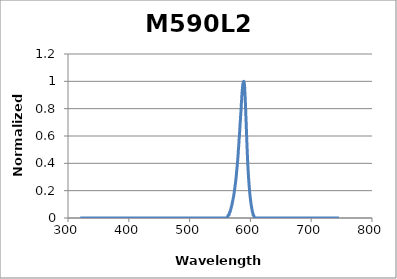
| Category | Normalized Intensity |
|---|---|
| 320.14817633 | 0 |
| 320.25686297 | 0 |
| 320.36555585 | 0 |
| 320.47425497 | 0 |
| 320.58296033 | 0 |
| 320.69167192 | 0 |
| 320.80038974 | 0 |
| 320.9091138 | 0 |
| 321.01784408 | 0 |
| 321.12658059 | 0 |
| 321.23532333 | 0 |
| 321.3440723 | 0 |
| 321.45282748 | 0 |
| 321.56158889 | 0 |
| 321.67035652 | 0 |
| 321.77913037 | 0 |
| 321.88791044 | 0 |
| 321.99669672 | 0 |
| 322.10548922 | 0 |
| 322.21428793 | 0 |
| 322.32309285 | 0 |
| 322.43190398 | 0 |
| 322.54072132 | 0 |
| 322.64954486 | 0 |
| 322.75837461 | 0 |
| 322.86721057 | 0 |
| 322.97605272 | 0 |
| 323.08490108 | 0 |
| 323.19375563 | 0 |
| 323.30261639 | 0 |
| 323.41148333 | 0 |
| 323.52035648 | 0 |
| 323.62923581 | 0 |
| 323.73812134 | 0 |
| 323.84701305 | 0 |
| 323.95591096 | 0 |
| 324.06481505 | 0 |
| 324.17372533 | 0 |
| 324.28264178 | 0 |
| 324.39156443 | 0 |
| 324.50049325 | 0 |
| 324.60942825 | 0 |
| 324.71836943 | 0 |
| 324.82731678 | 0 |
| 324.93627031 | 0 |
| 325.04523001 | 0 |
| 325.15419588 | 0 |
| 325.26316792 | 0 |
| 325.37214613 | 0 |
| 325.48113051 | 0 |
| 325.59012105 | 0 |
| 325.69911775 | 0 |
| 325.80812062 | 0 |
| 325.91712964 | 0 |
| 326.02614483 | 0 |
| 326.13516617 | 0 |
| 326.24419367 | 0 |
| 326.35322732 | 0 |
| 326.46226713 | 0 |
| 326.57131308 | 0 |
| 326.68036519 | 0 |
| 326.78942344 | 0 |
| 326.89848784 | 0 |
| 327.00755839 | 0 |
| 327.11663508 | 0 |
| 327.22571791 | 0 |
| 327.33480688 | 0 |
| 327.44390199 | 0 |
| 327.55300323 | 0 |
| 327.66211061 | 0 |
| 327.77122413 | 0 |
| 327.88034378 | 0 |
| 327.98946956 | 0 |
| 328.09860147 | 0 |
| 328.20773951 | 0 |
| 328.31688367 | 0 |
| 328.42603396 | 0 |
| 328.53519037 | 0 |
| 328.6443529 | 0 |
| 328.75352156 | 0 |
| 328.86269633 | 0 |
| 328.97187722 | 0 |
| 329.08106423 | 0 |
| 329.19025735 | 0 |
| 329.29945658 | 0 |
| 329.40866192 | 0 |
| 329.51787337 | 0 |
| 329.62709093 | 0 |
| 329.7363146 | 0 |
| 329.84554437 | 0 |
| 329.95478025 | 0 |
| 330.06402222 | 0 |
| 330.1732703 | 0 |
| 330.28252448 | 0 |
| 330.39178475 | 0 |
| 330.50105112 | 0 |
| 330.61032358 | 0 |
| 330.71960213 | 0 |
| 330.82888678 | 0 |
| 330.93817751 | 0 |
| 331.04747434 | 0 |
| 331.15677725 | 0 |
| 331.26608624 | 0 |
| 331.37540132 | 0 |
| 331.48472248 | 0 |
| 331.59404972 | 0 |
| 331.70338303 | 0 |
| 331.81272243 | 0 |
| 331.9220679 | 0 |
| 332.03141944 | 0 |
| 332.14077706 | 0 |
| 332.25014075 | 0 |
| 332.3595105 | 0 |
| 332.46888633 | 0 |
| 332.57826822 | 0 |
| 332.68765617 | 0 |
| 332.79705019 | 0 |
| 332.90645027 | 0 |
| 333.01585641 | 0 |
| 333.12526861 | 0 |
| 333.23468687 | 0 |
| 333.34411118 | 0 |
| 333.45354155 | 0 |
| 333.56297796 | 0 |
| 333.67242043 | 0 |
| 333.78186895 | 0 |
| 333.89132352 | 0 |
| 334.00078413 | 0 |
| 334.11025079 | 0 |
| 334.21972349 | 0 |
| 334.32920223 | 0 |
| 334.43868701 | 0 |
| 334.54817783 | 0 |
| 334.65767469 | 0 |
| 334.76717758 | 0 |
| 334.8766865 | 0 |
| 334.98620146 | 0 |
| 335.09572245 | 0 |
| 335.20524947 | 0 |
| 335.31478252 | 0 |
| 335.42432159 | 0 |
| 335.53386669 | 0 |
| 335.64341781 | 0 |
| 335.75297495 | 0 |
| 335.86253811 | 0 |
| 335.97210729 | 0 |
| 336.08168249 | 0 |
| 336.1912637 | 0 |
| 336.30085093 | 0 |
| 336.41044416 | 0 |
| 336.52004341 | 0 |
| 336.62964867 | 0 |
| 336.73925994 | 0 |
| 336.84887721 | 0 |
| 336.95850049 | 0 |
| 337.06812977 | 0 |
| 337.17776505 | 0 |
| 337.28740633 | 0 |
| 337.39705361 | 0 |
| 337.50670688 | 0 |
| 337.61636616 | 0 |
| 337.72603142 | 0 |
| 337.83570268 | 0 |
| 337.94537993 | 0 |
| 338.05506317 | 0 |
| 338.16475239 | 0 |
| 338.2744476 | 0 |
| 338.3841488 | 0 |
| 338.49385598 | 0 |
| 338.60356914 | 0 |
| 338.71328828 | 0 |
| 338.8230134 | 0 |
| 338.93274449 | 0 |
| 339.04248156 | 0 |
| 339.15222461 | 0 |
| 339.26197362 | 0 |
| 339.37172861 | 0 |
| 339.48148957 | 0 |
| 339.59125649 | 0 |
| 339.70102938 | 0 |
| 339.81080823 | 0 |
| 339.92059305 | 0 |
| 340.03038383 | 0 |
| 340.14018057 | 0 |
| 340.24998327 | 0 |
| 340.35979192 | 0 |
| 340.46960653 | 0 |
| 340.57942709 | 0 |
| 340.6892536 | 0 |
| 340.79908607 | 0 |
| 340.90892448 | 0 |
| 341.01876885 | 0 |
| 341.12861915 | 0 |
| 341.2384754 | 0 |
| 341.3483376 | 0 |
| 341.45820574 | 0 |
| 341.56807981 | 0 |
| 341.67795983 | 0 |
| 341.78784578 | 0 |
| 341.89773766 | 0 |
| 342.00763548 | 0 |
| 342.11753924 | 0 |
| 342.22744892 | 0 |
| 342.33736453 | 0 |
| 342.44728607 | 0 |
| 342.55721353 | 0 |
| 342.66714692 | 0 |
| 342.77708623 | 0 |
| 342.88703147 | 0 |
| 342.99698262 | 0 |
| 343.10693969 | 0 |
| 343.21690268 | 0 |
| 343.32687158 | 0 |
| 343.4368464 | 0 |
| 343.54682713 | 0 |
| 343.65681377 | 0 |
| 343.76680631 | 0 |
| 343.87680477 | 0 |
| 343.98680913 | 0 |
| 344.0968194 | 0 |
| 344.20683557 | 0 |
| 344.31685763 | 0 |
| 344.4268856 | 0 |
| 344.53691947 | 0 |
| 344.64695924 | 0 |
| 344.75700489 | 0 |
| 344.86705645 | 0 |
| 344.97711389 | 0 |
| 345.08717723 | 0 |
| 345.19724645 | 0 |
| 345.30732156 | 0 |
| 345.41740256 | 0 |
| 345.52748944 | 0 |
| 345.63758221 | 0 |
| 345.74768085 | 0 |
| 345.85778538 | 0 |
| 345.96789578 | 0 |
| 346.07801206 | 0 |
| 346.18813421 | 0 |
| 346.29826224 | 0 |
| 346.40839614 | 0 |
| 346.51853591 | 0 |
| 346.62868155 | 0 |
| 346.73883306 | 0 |
| 346.84899043 | 0 |
| 346.95915367 | 0 |
| 347.06932277 | 0 |
| 347.17949773 | 0 |
| 347.28967855 | 0 |
| 347.39986522 | 0 |
| 347.51005776 | 0 |
| 347.62025615 | 0 |
| 347.73046039 | 0 |
| 347.84067049 | 0 |
| 347.95088643 | 0 |
| 348.06110823 | 0 |
| 348.17133587 | 0 |
| 348.28156935 | 0 |
| 348.39180868 | 0 |
| 348.50205386 | 0 |
| 348.61230487 | 0 |
| 348.72256173 | 0 |
| 348.83282442 | 0 |
| 348.94309295 | 0 |
| 349.05336731 | 0 |
| 349.16364751 | 0 |
| 349.27393354 | 0 |
| 349.3842254 | 0 |
| 349.49452309 | 0 |
| 349.6048266 | 0 |
| 349.71513594 | 0 |
| 349.82545111 | 0 |
| 349.93577209 | 0 |
| 350.0460989 | 0 |
| 350.15643153 | 0 |
| 350.26676998 | 0 |
| 350.37711424 | 0 |
| 350.48746432 | 0 |
| 350.59782021 | 0 |
| 350.70818191 | 0 |
| 350.81854942 | 0 |
| 350.92892274 | 0 |
| 351.03930187 | 0 |
| 351.14968681 | 0 |
| 351.26007754 | 0 |
| 351.37047409 | 0 |
| 351.48087643 | 0 |
| 351.59128457 | 0 |
| 351.70169851 | 0 |
| 351.81211824 | 0 |
| 351.92254377 | 0 |
| 352.0329751 | 0 |
| 352.14341221 | 0 |
| 352.25385512 | 0 |
| 352.36430381 | 0 |
| 352.47475829 | 0 |
| 352.58521856 | 0 |
| 352.69568461 | 0 |
| 352.80615644 | 0 |
| 352.91663406 | 0 |
| 353.02711745 | 0 |
| 353.13760662 | 0 |
| 353.24810157 | 0 |
| 353.35860229 | 0 |
| 353.46910879 | 0 |
| 353.57962106 | 0 |
| 353.69013909 | 0 |
| 353.8006629 | 0 |
| 353.91119247 | 0 |
| 354.02172781 | 0 |
| 354.13226891 | 0 |
| 354.24281578 | 0 |
| 354.3533684 | 0 |
| 354.46392679 | 0 |
| 354.57449093 | 0 |
| 354.68506083 | 0 |
| 354.79563649 | 0 |
| 354.90621789 | 0 |
| 355.01680505 | 0 |
| 355.12739796 | 0 |
| 355.23799662 | 0 |
| 355.34860102 | 0 |
| 355.45921117 | 0 |
| 355.56982707 | 0 |
| 355.6804487 | 0 |
| 355.79107608 | 0 |
| 355.9017092 | 0 |
| 356.01234805 | 0 |
| 356.12299264 | 0 |
| 356.23364297 | 0 |
| 356.34429902 | 0 |
| 356.45496081 | 0 |
| 356.56562833 | 0 |
| 356.67630158 | 0 |
| 356.78698056 | 0 |
| 356.89766526 | 0 |
| 357.00835568 | 0 |
| 357.11905183 | 0 |
| 357.2297537 | 0 |
| 357.34046128 | 0 |
| 357.45117459 | 0 |
| 357.56189361 | 0 |
| 357.67261835 | 0 |
| 357.78334879 | 0 |
| 357.89408495 | 0 |
| 358.00482682 | 0 |
| 358.1155744 | 0 |
| 358.22632769 | 0 |
| 358.33708668 | 0 |
| 358.44785137 | 0 |
| 358.55862177 | 0 |
| 358.66939787 | 0 |
| 358.78017966 | 0 |
| 358.89096716 | 0 |
| 359.00176035 | 0 |
| 359.11255923 | 0 |
| 359.22336381 | 0 |
| 359.33417408 | 0 |
| 359.44499004 | 0 |
| 359.55581169 | 0 |
| 359.66663902 | 0 |
| 359.77747204 | 0 |
| 359.88831075 | 0 |
| 359.99915513 | 0 |
| 360.1100052 | 0 |
| 360.22086094 | 0 |
| 360.33172237 | 0 |
| 360.44258947 | 0 |
| 360.55346224 | 0 |
| 360.66434069 | 0 |
| 360.77522481 | 0 |
| 360.8861146 | 0 |
| 360.99701005 | 0 |
| 361.10791118 | 0 |
| 361.21881796 | 0 |
| 361.32973042 | 0 |
| 361.44064853 | 0 |
| 361.55157231 | 0 |
| 361.66250174 | 0 |
| 361.77343683 | 0 |
| 361.88437758 | 0 |
| 361.99532398 | 0 |
| 362.10627604 | 0 |
| 362.21723374 | 0 |
| 362.3281971 | 0 |
| 362.43916611 | 0 |
| 362.55014076 | 0 |
| 362.66112105 | 0 |
| 362.77210699 | 0 |
| 362.88309858 | 0 |
| 362.9940958 | 0 |
| 363.10509866 | 0 |
| 363.21610716 | 0 |
| 363.3271213 | 0 |
| 363.43814107 | 0 |
| 363.54916647 | 0 |
| 363.6601975 | 0 |
| 363.77123417 | 0 |
| 363.88227646 | 0 |
| 363.99332438 | 0 |
| 364.10437792 | 0 |
| 364.21543709 | 0 |
| 364.32650188 | 0 |
| 364.43757229 | 0 |
| 364.54864832 | 0 |
| 364.65972997 | 0 |
| 364.77081723 | 0 |
| 364.88191011 | 0 |
| 364.9930086 | 0 |
| 365.1041127 | 0 |
| 365.21522241 | 0 |
| 365.32633773 | 0 |
| 365.43745866 | 0 |
| 365.54858519 | 0 |
| 365.65971732 | 0 |
| 365.77085506 | 0 |
| 365.88199839 | 0 |
| 365.99314733 | 0 |
| 366.10430186 | 0 |
| 366.21546199 | 0 |
| 366.32662772 | 0 |
| 366.43779903 | 0 |
| 366.54897594 | 0 |
| 366.66015844 | 0 |
| 366.77134652 | 0 |
| 366.88254019 | 0 |
| 366.99373945 | 0 |
| 367.10494429 | 0 |
| 367.21615471 | 0 |
| 367.32737072 | 0 |
| 367.4385923 | 0 |
| 367.54981946 | 0 |
| 367.66105219 | 0 |
| 367.7722905 | 0 |
| 367.88353438 | 0 |
| 367.99478384 | 0 |
| 368.10603886 | 0 |
| 368.21729945 | 0 |
| 368.32856561 | 0 |
| 368.43983733 | 0 |
| 368.55111462 | 0 |
| 368.66239746 | 0 |
| 368.77368587 | 0 |
| 368.88497984 | 0 |
| 368.99627936 | 0 |
| 369.10758444 | 0 |
| 369.21889508 | 0 |
| 369.33021127 | 0 |
| 369.441533 | 0 |
| 369.55286029 | 0 |
| 369.66419313 | 0 |
| 369.77553151 | 0 |
| 369.88687544 | 0 |
| 369.99822491 | 0 |
| 370.10957992 | 0 |
| 370.22094047 | 0 |
| 370.33230656 | 0 |
| 370.44367819 | 0 |
| 370.55505536 | 0 |
| 370.66643806 | 0 |
| 370.77782629 | 0 |
| 370.88922005 | 0 |
| 371.00061934 | 0 |
| 371.11202416 | 0 |
| 371.22343451 | 0 |
| 371.33485038 | 0 |
| 371.44627178 | 0 |
| 371.55769869 | 0 |
| 371.66913113 | 0 |
| 371.78056908 | 0 |
| 371.89201256 | 0 |
| 372.00346155 | 0 |
| 372.11491605 | 0 |
| 372.22637606 | 0 |
| 372.33784159 | 0 |
| 372.44931262 | 0 |
| 372.56078917 | 0 |
| 372.67227122 | 0 |
| 372.78375877 | 0 |
| 372.89525183 | 0 |
| 373.00675039 | 0 |
| 373.11825445 | 0 |
| 373.22976401 | 0 |
| 373.34127907 | 0 |
| 373.45279962 | 0 |
| 373.56432566 | 0 |
| 373.6758572 | 0 |
| 373.78739423 | 0 |
| 373.89893675 | 0 |
| 374.01048476 | 0 |
| 374.12203825 | 0 |
| 374.23359723 | 0 |
| 374.34516169 | 0 |
| 374.45673163 | 0 |
| 374.56830705 | 0 |
| 374.67988796 | 0 |
| 374.79147433 | 0 |
| 374.90306619 | 0 |
| 375.01466352 | 0 |
| 375.12626632 | 0 |
| 375.23787459 | 0 |
| 375.34948833 | 0 |
| 375.46110754 | 0 |
| 375.57273221 | 0 |
| 375.68436235 | 0 |
| 375.79599796 | 0 |
| 375.90763902 | 0 |
| 376.01928555 | 0 |
| 376.13093753 | 0 |
| 376.24259497 | 0 |
| 376.35425787 | 0 |
| 376.46592622 | 0 |
| 376.57760002 | 0 |
| 376.68927927 | 0 |
| 376.80096397 | 0 |
| 376.91265413 | 0 |
| 377.02434972 | 0 |
| 377.13605076 | 0 |
| 377.24775725 | 0 |
| 377.35946917 | 0 |
| 377.47118654 | 0 |
| 377.58290935 | 0 |
| 377.69463759 | 0 |
| 377.80637126 | 0 |
| 377.91811038 | 0 |
| 378.02985492 | 0 |
| 378.14160489 | 0 |
| 378.2533603 | 0 |
| 378.36512113 | 0 |
| 378.47688739 | 0 |
| 378.58865907 | 0 |
| 378.70043617 | 0 |
| 378.8122187 | 0 |
| 378.92400665 | 0 |
| 379.03580001 | 0 |
| 379.1475988 | 0 |
| 379.25940299 | 0 |
| 379.37121261 | 0 |
| 379.48302763 | 0 |
| 379.59484806 | 0 |
| 379.70667391 | 0 |
| 379.81850516 | 0 |
| 379.93034182 | 0 |
| 380.04218388 | 0 |
| 380.15403135 | 0 |
| 380.26588421 | 0 |
| 380.37774248 | 0 |
| 380.48960615 | 0 |
| 380.60147521 | 0 |
| 380.71334967 | 0 |
| 380.82522952 | 0 |
| 380.93711476 | 0 |
| 381.0490054 | 0 |
| 381.16090142 | 0 |
| 381.27280283 | 0 |
| 381.38470963 | 0 |
| 381.49662181 | 0 |
| 381.60853938 | 0 |
| 381.72046232 | 0 |
| 381.83239065 | 0 |
| 381.94432436 | 0 |
| 382.05626344 | 0 |
| 382.16820789 | 0 |
| 382.28015772 | 0 |
| 382.39211293 | 0 |
| 382.5040735 | 0 |
| 382.61603944 | 0 |
| 382.72801076 | 0 |
| 382.83998743 | 0 |
| 382.95196947 | 0 |
| 383.06395688 | 0 |
| 383.17594964 | 0 |
| 383.28794777 | 0 |
| 383.39995125 | 0 |
| 383.51196009 | 0 |
| 383.62397429 | 0 |
| 383.73599384 | 0 |
| 383.84801874 | 0 |
| 383.96004899 | 0 |
| 384.07208459 | 0 |
| 384.18412554 | 0 |
| 384.29617184 | 0 |
| 384.40822348 | 0 |
| 384.52028046 | 0 |
| 384.63234278 | 0 |
| 384.74441044 | 0 |
| 384.85648345 | 0 |
| 384.96856178 | 0 |
| 385.08064546 | 0 |
| 385.19273447 | 0 |
| 385.30482881 | 0 |
| 385.41692848 | 0 |
| 385.52903347 | 0 |
| 385.6411438 | 0 |
| 385.75325945 | 0 |
| 385.86538043 | 0 |
| 385.97750673 | 0 |
| 386.08963835 | 0 |
| 386.20177529 | 0 |
| 386.31391755 | 0 |
| 386.42606513 | 0 |
| 386.53821802 | 0 |
| 386.65037622 | 0 |
| 386.76253974 | 0 |
| 386.87470857 | 0 |
| 386.9868827 | 0 |
| 387.09906215 | 0 |
| 387.2112469 | 0 |
| 387.32343695 | 0 |
| 387.43563231 | 0 |
| 387.54783297 | 0 |
| 387.66003892 | 0 |
| 387.77225018 | 0 |
| 387.88446673 | 0 |
| 387.99668858 | 0 |
| 388.10891572 | 0 |
| 388.22114815 | 0 |
| 388.33338588 | 0 |
| 388.44562889 | 0 |
| 388.55787719 | 0 |
| 388.67013078 | 0 |
| 388.78238965 | 0 |
| 388.8946538 | 0 |
| 389.00692323 | 0 |
| 389.11919795 | 0 |
| 389.23147794 | 0 |
| 389.34376321 | 0 |
| 389.45605375 | 0 |
| 389.56834957 | 0 |
| 389.68065066 | 0 |
| 389.79295702 | 0 |
| 389.90526865 | 0 |
| 390.01758554 | 0 |
| 390.1299077 | 0 |
| 390.24223513 | 0 |
| 390.35456782 | 0 |
| 390.46690577 | 0 |
| 390.57924898 | 0 |
| 390.69159745 | 0 |
| 390.80395117 | 0 |
| 390.91631015 | 0 |
| 391.02867438 | 0 |
| 391.14104387 | 0 |
| 391.2534186 | 0 |
| 391.36579858 | 0 |
| 391.47818382 | 0 |
| 391.59057429 | 0 |
| 391.70297001 | 0 |
| 391.81537098 | 0 |
| 391.92777718 | 0 |
| 392.04018863 | 0 |
| 392.15260531 | 0 |
| 392.26502723 | 0 |
| 392.37745438 | 0 |
| 392.48988677 | 0 |
| 392.60232439 | 0 |
| 392.71476724 | 0 |
| 392.82721532 | 0 |
| 392.93966862 | 0 |
| 393.05212715 | 0 |
| 393.16459091 | 0 |
| 393.27705989 | 0 |
| 393.38953408 | 0 |
| 393.5020135 | 0 |
| 393.61449814 | 0 |
| 393.72698799 | 0 |
| 393.83948306 | 0 |
| 393.95198334 | 0 |
| 394.06448883 | 0 |
| 394.17699954 | 0 |
| 394.28951545 | 0 |
| 394.40203657 | 0 |
| 394.51456289 | 0 |
| 394.62709442 | 0 |
| 394.73963116 | 0 |
| 394.85217309 | 0 |
| 394.96472022 | 0 |
| 395.07727255 | 0 |
| 395.18983008 | 0 |
| 395.3023928 | 0 |
| 395.41496071 | 0 |
| 395.52753382 | 0 |
| 395.64011212 | 0 |
| 395.7526956 | 0 |
| 395.86528427 | 0 |
| 395.97787813 | 0 |
| 396.09047717 | 0 |
| 396.2030814 | 0 |
| 396.3156908 | 0 |
| 396.42830539 | 0 |
| 396.54092515 | 0 |
| 396.65355009 | 0 |
| 396.76618021 | 0 |
| 396.87881549 | 0 |
| 396.99145595 | 0 |
| 397.10410158 | 0 |
| 397.21675238 | 0 |
| 397.32940834 | 0 |
| 397.44206947 | 0 |
| 397.55473577 | 0 |
| 397.66740723 | 0 |
| 397.78008384 | 0 |
| 397.89276562 | 0 |
| 398.00545256 | 0 |
| 398.11814465 | 0 |
| 398.23084189 | 0 |
| 398.34354429 | 0 |
| 398.45625184 | 0 |
| 398.56896455 | 0 |
| 398.6816824 | 0 |
| 398.79440539 | 0 |
| 398.90713353 | 0 |
| 399.01986682 | 0 |
| 399.13260525 | 0 |
| 399.24534882 | 0 |
| 399.35809753 | 0 |
| 399.47085137 | 0 |
| 399.58361036 | 0 |
| 399.69637448 | 0 |
| 399.80914373 | 0 |
| 399.92191811 | 0 |
| 400.03469762 | 0 |
| 400.14748226 | 0 |
| 400.26027203 | 0 |
| 400.37306692 | 0 |
| 400.48586694 | 0 |
| 400.59867208 | 0 |
| 400.71148234 | 0 |
| 400.82429772 | 0 |
| 400.93711822 | 0 |
| 401.04994383 | 0 |
| 401.16277456 | 0 |
| 401.2756104 | 0 |
| 401.38845136 | 0 |
| 401.50129742 | 0 |
| 401.61414859 | 0 |
| 401.72700487 | 0 |
| 401.83986625 | 0 |
| 401.95273274 | 0 |
| 402.06560433 | 0 |
| 402.17848102 | 0 |
| 402.29136281 | 0 |
| 402.4042497 | 0 |
| 402.51714169 | 0 |
| 402.63003876 | 0 |
| 402.74294094 | 0 |
| 402.8558482 | 0 |
| 402.96876055 | 0 |
| 403.08167799 | 0 |
| 403.19460052 | 0 |
| 403.30752814 | 0 |
| 403.42046083 | 0 |
| 403.53339861 | 0 |
| 403.64634147 | 0 |
| 403.75928941 | 0 |
| 403.87224243000003 | 0 |
| 403.98520053 | 0 |
| 404.09816369 | 0 |
| 404.21113193 | 0 |
| 404.32410525 | 0 |
| 404.43708363 | 0 |
| 404.55006708 | 0 |
| 404.6630556 | 0 |
| 404.77604918 | 0 |
| 404.88904783 | 0 |
| 405.00205154 | 0 |
| 405.11506031 | 0 |
| 405.22807414 | 0 |
| 405.34109302 | 0 |
| 405.45411697 | 0 |
| 405.56714596 | 0 |
| 405.68018001 | 0 |
| 405.79321911 | 0 |
| 405.90626326 | 0 |
| 406.01931246 | 0 |
| 406.13236671 | 0 |
| 406.245426 | 0 |
| 406.35849034 | 0 |
| 406.47155972 | 0 |
| 406.58463413 | 0 |
| 406.69771359 | 0 |
| 406.81079809 | 0 |
| 406.92388762 | 0 |
| 407.03698218 | 0 |
| 407.15008178 | 0 |
| 407.26318641 | 0 |
| 407.37629607 | 0 |
| 407.48941076 | 0 |
| 407.60253047 | 0 |
| 407.71565521 | 0 |
| 407.82878497 | 0 |
| 407.94191976 | 0 |
| 408.05505956 | 0 |
| 408.16820439 | 0 |
| 408.28135423 | 0 |
| 408.39450909 | 0 |
| 408.50766896 | 0 |
| 408.62083385 | 0 |
| 408.73400375 | 0 |
| 408.84717865 | 0 |
| 408.96035857 | 0 |
| 409.07354349 | 0 |
| 409.18673342 | 0 |
| 409.29992835 | 0 |
| 409.41312828 | 0 |
| 409.52633321 | 0 |
| 409.63954314 | 0 |
| 409.75275807 | 0 |
| 409.865978 | 0 |
| 409.97920292 | 0 |
| 410.09243283 | 0 |
| 410.20566773 | 0 |
| 410.31890763 | 0 |
| 410.43215251 | 0 |
| 410.54540238 | 0 |
| 410.65865723 | 0 |
| 410.77191707 | 0 |
| 410.88518189 | 0 |
| 410.99845169 | 0 |
| 411.11172647 | 0 |
| 411.22500622 | 0 |
| 411.33829095 | 0 |
| 411.45158066 | 0 |
| 411.56487534 | 0 |
| 411.67817499 | 0 |
| 411.79147961 | 0 |
| 411.9047892 | 0 |
| 412.01810375 | 0 |
| 412.13142327 | 0 |
| 412.24474775 | 0 |
| 412.3580772 | 0 |
| 412.4714116 | 0 |
| 412.58475097 | 0 |
| 412.69809529 | 0 |
| 412.81144456 | 0 |
| 412.9247988 | 0 |
| 413.03815798 | 0 |
| 413.15152212 | 0 |
| 413.2648912 | 0 |
| 413.37826523 | 0 |
| 413.49164421 | 0 |
| 413.60502814 | 0 |
| 413.71841701 | 0 |
| 413.83181082 | 0 |
| 413.94520957 | 0 |
| 414.05861326 | 0 |
| 414.17202188 | 0 |
| 414.28543545 | 0 |
| 414.39885394 | 0 |
| 414.51227737 | 0 |
| 414.62570573 | 0 |
| 414.73913902 | 0 |
| 414.85257724 | 0 |
| 414.96602038 | 0 |
| 415.07946845 | 0 |
| 415.19292145 | 0 |
| 415.30637936 | 0 |
| 415.4198422 | 0 |
| 415.53330995 | 0 |
| 415.64678262 | 0 |
| 415.76026021 | 0 |
| 415.87374271 | 0 |
| 415.98723012 | 0 |
| 416.10072245 | 0 |
| 416.21421968 | 0 |
| 416.32772182 | 0 |
| 416.44122887 | 0 |
| 416.55474082 | 0 |
| 416.66825768 | 0 |
| 416.78177944 | 0 |
| 416.8953061 | 0 |
| 417.00883765 | 0 |
| 417.12237411 | 0 |
| 417.23591546 | 0 |
| 417.3494617 | 0 |
| 417.46301284 | 0 |
| 417.57656887 | 0 |
| 417.69012979 | 0 |
| 417.80369559 | 0 |
| 417.91726628 | 0 |
| 418.03084186 | 0 |
| 418.14442232 | 0 |
| 418.25800766 | 0 |
| 418.37159788 | 0 |
| 418.48519298 | 0 |
| 418.59879296 | 0 |
| 418.71239782 | 0 |
| 418.82600754 | 0 |
| 418.93962214 | 0 |
| 419.05324161 | 0 |
| 419.16686595 | 0 |
| 419.28049516 | 0 |
| 419.39412924 | 0 |
| 419.50776818 | 0 |
| 419.62141198 | 0 |
| 419.73506064 | 0 |
| 419.84871417 | 0 |
| 419.96237255 | 0 |
| 420.07603579 | 0 |
| 420.18970389 | 0 |
| 420.30337684 | 0 |
| 420.41705464 | 0 |
| 420.53073729 | 0 |
| 420.6444248 | 0 |
| 420.75811715 | 0 |
| 420.87181434 | 0 |
| 420.98551638 | 0 |
| 421.09922327 | 0 |
| 421.212935 | 0 |
| 421.32665156 | 0 |
| 421.44037297 | 0 |
| 421.55409921 | 0 |
| 421.66783029 | 0 |
| 421.7815662 | 0 |
| 421.89530694 | 0 |
| 422.00905252 | 0 |
| 422.12280292 | 0 |
| 422.23655815 | 0 |
| 422.35031821 | 0 |
| 422.46408309 | 0 |
| 422.5778528 | 0 |
| 422.69162733 | 0 |
| 422.80540667 | 0 |
| 422.91919084 | 0 |
| 423.03297982 | 0 |
| 423.14677362 | 0 |
| 423.26057223 | 0 |
| 423.37437566 | 0 |
| 423.4881839 | 0 |
| 423.60199694 | 0 |
| 423.71581479 | 0 |
| 423.82963745 | 0 |
| 423.94346492 | 0 |
| 424.05729718 | 0 |
| 424.17113425 | 0 |
| 424.28497612 | 0 |
| 424.39882279 | 0 |
| 424.51267425 | 0 |
| 424.62653051 | 0 |
| 424.74039156 | 0 |
| 424.85425741 | 0 |
| 424.96812804 | 0 |
| 425.08200347 | 0 |
| 425.19588368 | 0 |
| 425.30976868 | 0 |
| 425.42365846 | 0 |
| 425.53755303 | 0 |
| 425.65145238 | 0 |
| 425.76535651 | 0 |
| 425.87926541 | 0 |
| 425.9931791 | 0 |
| 426.10709756 | 0 |
| 426.22102079 | 0 |
| 426.33494879 | 0 |
| 426.44888157 | 0 |
| 426.56281911 | 0 |
| 426.67676143 | 0 |
| 426.7907085 | 0 |
| 426.90466035 | 0 |
| 427.01861695 | 0 |
| 427.13257832 | 0 |
| 427.24654445 | 0 |
| 427.36051534 | 0 |
| 427.47449098 | 0 |
| 427.58847138 | 0 |
| 427.70245653 | 0 |
| 427.81644643 | 0 |
| 427.93044109 | 0 |
| 428.04444049 | 0 |
| 428.15844464 | 0 |
| 428.27245354 | 0 |
| 428.38646718 | 0 |
| 428.50048557 | 0 |
| 428.61450869 | 0 |
| 428.72853656 | 0 |
| 428.84256916 | 0 |
| 428.9566065 | 0 |
| 429.07064858 | 0 |
| 429.18469539 | 0 |
| 429.29874693 | 0 |
| 429.41280321 | 0 |
| 429.52686421 | 0 |
| 429.64092994 | 0 |
| 429.75500039 | 0 |
| 429.86907557 | 0 |
| 429.98315548 | 0 |
| 430.0972401 | 0 |
| 430.21132944 | 0 |
| 430.32542351 | 0 |
| 430.43952229 | 0 |
| 430.55362578 | 0 |
| 430.66773399 | 0 |
| 430.78184691 | 0 |
| 430.89596454 | 0 |
| 431.01008688 | 0 |
| 431.12421393 | 0 |
| 431.23834568 | 0 |
| 431.35248214 | 0 |
| 431.4666233 | 0 |
| 431.58076916 | 0 |
| 431.69491972 | 0 |
| 431.80907498 | 0 |
| 431.92323494 | 0 |
| 432.03739959 | 0 |
| 432.15156893 | 0 |
| 432.26574297 | 0 |
| 432.3799217 | 0 |
| 432.49410511 | 0 |
| 432.60829322 | 0 |
| 432.72248601 | 0 |
| 432.83668348 | 0 |
| 432.95088564 | 0 |
| 433.06509248 | 0 |
| 433.179304 | 0 |
| 433.29352019 | 0 |
| 433.40774107 | 0 |
| 433.52196661 | 0 |
| 433.63619684 | 0 |
| 433.75043173 | 0 |
| 433.86467129 | 0 |
| 433.97891553 | 0 |
| 434.09316443 | 0 |
| 434.20741799 | 0 |
| 434.32167622 | 0 |
| 434.43593912 | 0 |
| 434.55020667 | 0 |
| 434.66447889 | 0 |
| 434.77875576 | 0 |
| 434.89303729 | 0 |
| 435.00732347 | 0 |
| 435.12161431 | 0 |
| 435.2359098 | 0 |
| 435.35020994 | 0 |
| 435.46451473 | 0 |
| 435.57882416 | 0 |
| 435.69313824 | 0 |
| 435.80745697 | 0 |
| 435.92178034 | 0 |
| 436.03610835 | 0 |
| 436.150441 | 0 |
| 436.26477829 | 0 |
| 436.37912021 | 0 |
| 436.49346677 | 0 |
| 436.60781796 | 0 |
| 436.72217379 | 0 |
| 436.83653424 | 0 |
| 436.95089932 | 0 |
| 437.06526904 | 0 |
| 437.17964337 | 0 |
| 437.29402233 | 0 |
| 437.40840592 | 0 |
| 437.52279412 | 0 |
| 437.63718695 | 0 |
| 437.75158439 | 0 |
| 437.86598645 | 0 |
| 437.98039312 | 0 |
| 438.09480441 | 0 |
| 438.20922031 | 0 |
| 438.32364082 | 0 |
| 438.43806593 | 0 |
| 438.55249566 | 0 |
| 438.66692999 | 0 |
| 438.78136893 | 0 |
| 438.89581246 | 0 |
| 439.0102606 | 0 |
| 439.12471334 | 0 |
| 439.23917068 | 0 |
| 439.35363261 | 0 |
| 439.46809914 | 0 |
| 439.58257026 | 0 |
| 439.69704597 | 0 |
| 439.81152627 | 0 |
| 439.92601117 | 0 |
| 440.04050065 | 0 |
| 440.15499471 | 0 |
| 440.26949336 | 0 |
| 440.38399659 | 0 |
| 440.4985044 | 0 |
| 440.61301679 | 0 |
| 440.72753376 | 0 |
| 440.84205531 | 0 |
| 440.95658143 | 0 |
| 441.07111213 | 0 |
| 441.18564739 | 0 |
| 441.30018723 | 0 |
| 441.41473163 | 0 |
| 441.5292806 | 0 |
| 441.64383414 | 0 |
| 441.75839224 | 0 |
| 441.87295491 | 0 |
| 441.98752213 | 0 |
| 442.10209392 | 0 |
| 442.21667026 | 0 |
| 442.33125116 | 0 |
| 442.44583661 | 0 |
| 442.56042662 | 0 |
| 442.67502118 | 0 |
| 442.78962029 | 0 |
| 442.90422394 | 0 |
| 443.01883215 | 0 |
| 443.1334449 | 0 |
| 443.24806219 | 0 |
| 443.36268403 | 0 |
| 443.47731041 | 0 |
| 443.59194132 | 0 |
| 443.70657678 | 0 |
| 443.82121677 | 0 |
| 443.93586129 | 0 |
| 444.05051035 | 0 |
| 444.16516394 | 0 |
| 444.27982206 | 0 |
| 444.39448471 | 0 |
| 444.50915189 | 0 |
| 444.62382359 | 0 |
| 444.73849982 | 0 |
| 444.85318056 | 0 |
| 444.96786583 | 0 |
| 445.08255562 | 0 |
| 445.19724993 | 0 |
| 445.31194875 | 0 |
| 445.42665209 | 0 |
| 445.54135994 | 0 |
| 445.6560723 | 0 |
| 445.77078917 | 0 |
| 445.88551055 | 0 |
| 446.00023644 | 0 |
| 446.11496683 | 0 |
| 446.22970173 | 0 |
| 446.34444113 | 0 |
| 446.45918503 | 0 |
| 446.57393342 | 0 |
| 446.68868632 | 0 |
| 446.80344371 | 0 |
| 446.9182056 | 0 |
| 447.03297198 | 0 |
| 447.14774285 | 0 |
| 447.26251822 | 0 |
| 447.37729807 | 0 |
| 447.49208241 | 0 |
| 447.60687123 | 0 |
| 447.72166453 | 0 |
| 447.83646232 | 0 |
| 447.95126459 | 0 |
| 448.06607134 | 0 |
| 448.18088257 | 0 |
| 448.29569827 | 0 |
| 448.41051845 | 0 |
| 448.5253431 | 0 |
| 448.64017222 | 0 |
| 448.75500582 | 0 |
| 448.86984388 | 0 |
| 448.9846864 | 0 |
| 449.0995334 | 0 |
| 449.21438485 | 0 |
| 449.32924077 | 0 |
| 449.44410115 | 0 |
| 449.55896599 | 0 |
| 449.67383529 | 0 |
| 449.78870904 | 0 |
| 449.90358725 | 0 |
| 450.01846991 | 0 |
| 450.13335702 | 0 |
| 450.24824858 | 0 |
| 450.36314459 | 0 |
| 450.47804504 | 0 |
| 450.59294995 | 0 |
| 450.70785929 | 0 |
| 450.82277308 | 0 |
| 450.93769131 | 0 |
| 451.05261398 | 0 |
| 451.16754108 | 0 |
| 451.28247262 | 0 |
| 451.3974086 | 0 |
| 451.51234901 | 0 |
| 451.62729385 | 0 |
| 451.74224312 | 0 |
| 451.85719681 | 0 |
| 451.97215494 | 0 |
| 452.08711749 | 0 |
| 452.20208446 | 0 |
| 452.31705586 | 0 |
| 452.43203168 | 0 |
| 452.54701191 | 0 |
| 452.66199657 | 0 |
| 452.77698563 | 0 |
| 452.89197912 | 0 |
| 453.00697702 | 0 |
| 453.12197932 | 0 |
| 453.23698604 | 0 |
| 453.35199717 | 0 |
| 453.4670127 | 0 |
| 453.58203264 | 0 |
| 453.69705698 | 0 |
| 453.81208572 | 0 |
| 453.92711887 | 0 |
| 454.04215641 | 0 |
| 454.15719835 | 0 |
| 454.27224469 | 0 |
| 454.38729542 | 0 |
| 454.50235054 | 0 |
| 454.61741006 | 0 |
| 454.73247396 | 0 |
| 454.84754226 | 0 |
| 454.96261494 | 0 |
| 455.077692 | 0 |
| 455.19277345 | 0 |
| 455.30785928 | 0 |
| 455.42294949 | 0 |
| 455.53804408 | 0 |
| 455.65314305 | 0 |
| 455.76824639 | 0 |
| 455.88335411 | 0 |
| 455.9984662 | 0 |
| 456.11358267 | 0 |
| 456.2287035 | 0 |
| 456.3438287 | 0 |
| 456.45895826 | 0 |
| 456.5740922 | 0 |
| 456.68923049 | 0 |
| 456.80437315 | 0 |
| 456.91952017 | 0 |
| 457.03467154 | 0 |
| 457.14982728 | 0 |
| 457.26498737 | 0 |
| 457.38015181 | 0 |
| 457.49532061 | 0 |
| 457.61049375 | 0 |
| 457.72567125 | 0 |
| 457.8408531 | 0 |
| 457.95603929 | 0 |
| 458.07122983 | 0 |
| 458.18642471 | 0 |
| 458.30162393 | 0 |
| 458.41682749 | 0 |
| 458.5320354 | 0 |
| 458.64724764 | 0 |
| 458.76246421 | 0 |
| 458.87768512 | 0 |
| 458.99291036 | 0 |
| 459.10813994 | 0 |
| 459.22337384 | 0 |
| 459.33861207 | 0 |
| 459.45385463 | 0 |
| 459.56910151 | 0 |
| 459.68435272 | 0 |
| 459.79960824 | 0 |
| 459.91486809 | 0 |
| 460.03013226 | 0 |
| 460.14540074 | 0 |
| 460.26067354 | 0 |
| 460.37595066 | 0 |
| 460.49123209 | 0 |
| 460.60651782 | 0 |
| 460.72180787 | 0 |
| 460.83710223 | 0 |
| 460.95240089 | 0 |
| 461.06770386 | 0 |
| 461.18301113 | 0 |
| 461.2983227 | 0 |
| 461.41363857 | 0 |
| 461.52895874 | 0 |
| 461.64428321 | 0 |
| 461.75961198 | 0 |
| 461.87494503 | 0 |
| 461.99028239 | 0 |
| 462.10562403 | 0 |
| 462.22096996 | 0 |
| 462.33632018 | 0 |
| 462.45167468 | 0 |
| 462.56703348 | 0 |
| 462.68239655 | 0 |
| 462.79776391 | 0 |
| 462.91313554 | 0 |
| 463.02851146 | 0 |
| 463.14389165 | 0 |
| 463.25927612 | 0 |
| 463.37466486 | 0 |
| 463.49005787 | 0 |
| 463.60545516 | 0 |
| 463.72085671 | 0 |
| 463.83626254 | 0 |
| 463.95167263 | 0 |
| 464.06708698 | 0 |
| 464.1825056 | 0 |
| 464.29792848 | 0 |
| 464.41335562 | 0 |
| 464.52878702 | 0 |
| 464.64422267 | 0 |
| 464.75966258 | 0 |
| 464.87510675 | 0 |
| 464.99055516 | 0 |
| 465.10600783 | 0 |
| 465.22146475 | 0 |
| 465.33692591 | 0 |
| 465.45239133 | 0 |
| 465.56786098 | 0 |
| 465.68333488 | 0 |
| 465.79881303 | 0 |
| 465.91429541 | 0 |
| 466.02978203 | 0 |
| 466.14527288 | 0 |
| 466.26076798 | 0 |
| 466.3762673 | 0 |
| 466.49177086 | 0 |
| 466.60727865 | 0 |
| 466.72279067 | 0 |
| 466.83830692 | 0 |
| 466.9538274 | 0 |
| 467.06935209 | 0 |
| 467.18488102 | 0 |
| 467.30041416 | 0 |
| 467.41595152 | 0 |
| 467.53149311 | 0 |
| 467.6470389 | 0 |
| 467.76258892 | 0 |
| 467.87814315 | 0 |
| 467.99370159 | 0 |
| 468.10926424 | 0 |
| 468.2248311 | 0 |
| 468.34040217 | 0 |
| 468.45597745 | 0 |
| 468.57155693 | 0 |
| 468.68714061 | 0 |
| 468.80272849 | 0 |
| 468.91832058 | 0 |
| 469.03391686 | 0 |
| 469.14951734 | 0 |
| 469.26512202 | 0 |
| 469.38073089 | 0 |
| 469.49634395 | 0 |
| 469.6119612 | 0 |
| 469.72758264 | 0 |
| 469.84320827 | 0 |
| 469.95883809 | 0 |
| 470.07447209 | 0 |
| 470.19011027 | 0 |
| 470.30575264 | 0 |
| 470.42139918 | 0 |
| 470.53704991 | 0 |
| 470.65270481 | 0 |
| 470.76836388 | 0 |
| 470.88402713 | 0 |
| 470.99969455 | 0 |
| 471.11536615 | 0 |
| 471.23104191 | 0 |
| 471.34672184 | 0 |
| 471.46240593 | 0 |
| 471.5780942 | 0 |
| 471.69378662 | 0 |
| 471.8094832 | 0 |
| 471.92518395 | 0 |
| 472.04088885 | 0 |
| 472.15659791 | 0 |
| 472.27231113 | 0 |
| 472.3880285 | 0 |
| 472.50375002 | 0 |
| 472.61947569 | 0 |
| 472.73520551 | 0 |
| 472.85093948 | 0 |
| 472.9666776 | 0 |
| 473.08241986 | 0 |
| 473.19816626 | 0 |
| 473.3139168 | 0 |
| 473.42967149 | 0 |
| 473.54543031 | 0 |
| 473.66119327 | 0 |
| 473.77696036 | 0 |
| 473.89273159 | 0 |
| 474.00850695 | 0 |
| 474.12428644 | 0 |
| 474.24007006 | 0 |
| 474.35585781 | 0 |
| 474.47164969 | 0 |
| 474.58744568 | 0 |
| 474.70324581 | 0 |
| 474.81905005 | 0 |
| 474.93485841 | 0 |
| 475.05067089 | 0 |
| 475.16648749 | 0 |
| 475.2823082 | 0 |
| 475.39813303 | 0 |
| 475.51396197 | 0 |
| 475.62979502 | 0 |
| 475.74563218 | 0 |
| 475.86147344 | 0 |
| 475.97731881 | 0 |
| 476.09316829 | 0 |
| 476.20902187 | 0 |
| 476.32487955 | 0 |
| 476.44074133 | 0 |
| 476.55660721 | 0 |
| 476.67247718 | 0 |
| 476.78835125 | 0 |
| 476.90422942 | 0 |
| 477.02011167 | 0 |
| 477.13599802 | 0 |
| 477.25188846 | 0 |
| 477.36778298 | 0 |
| 477.48368159 | 0 |
| 477.59958428 | 0 |
| 477.71549106 | 0 |
| 477.83140192 | 0 |
| 477.94731686 | 0 |
| 478.06323587 | 0 |
| 478.17915896 | 0 |
| 478.29508613 | 0 |
| 478.41101737 | 0 |
| 478.52695269 | 0 |
| 478.64289207 | 0 |
| 478.75883552 | 0 |
| 478.87478304 | 0 |
| 478.99073463 | 0 |
| 479.10669028 | 0 |
| 479.22264999 | 0 |
| 479.33861377 | 0 |
| 479.4545816 | 0 |
| 479.57055349 | 0 |
| 479.68652944 | 0 |
| 479.80250945 | 0 |
| 479.9184935 | 0 |
| 480.03448161 | 0 |
| 480.15047377 | 0 |
| 480.26646998 | 0 |
| 480.38247024 | 0 |
| 480.49847454 | 0 |
| 480.61448289 | 0 |
| 480.73049528 | 0 |
| 480.84651171 | 0 |
| 480.96253218 | 0 |
| 481.07855669 | 0 |
| 481.19458523 | 0 |
| 481.31061781 | 0 |
| 481.42665442 | 0 |
| 481.54269507 | 0 |
| 481.65873974 | 0 |
| 481.77478845 | 0 |
| 481.89084118 | 0 |
| 482.00689794 | 0 |
| 482.12295872 | 0 |
| 482.23902352 | 0 |
| 482.35509235 | 0 |
| 482.4711652 | 0 |
| 482.58724206 | 0 |
| 482.70332294 | 0 |
| 482.81940783 | 0 |
| 482.93549674 | 0 |
| 483.05158966 | 0 |
| 483.16768659 | 0 |
| 483.28378753 | 0 |
| 483.39989248 | 0 |
| 483.51600143 | 0 |
| 483.63211439 | 0 |
| 483.74823135 | 0 |
| 483.86435231 | 0 |
| 483.98047727 | 0 |
| 484.09660622 | 0 |
| 484.21273918 | 0 |
| 484.32887613 | 0 |
| 484.44501707 | 0 |
| 484.56116201 | 0 |
| 484.67731093 | 0 |
| 484.79346384 | 0 |
| 484.90962075 | 0 |
| 485.02578163 | 0 |
| 485.1419465 | 0 |
| 485.25811536 | 0 |
| 485.37428819 | 0 |
| 485.490465 | 0 |
| 485.6066458 | 0 |
| 485.72283056 | 0 |
| 485.83901931 | 0 |
| 485.95521202 | 0 |
| 486.07140871 | 0 |
| 486.18760937 | 0 |
| 486.303814 | 0 |
| 486.42002259 | 0 |
| 486.53623515 | 0 |
| 486.65245168 | 0 |
| 486.76867216 | 0 |
| 486.88489661 | 0 |
| 487.00112502 | 0 |
| 487.11735738 | 0 |
| 487.2335937 | 0 |
| 487.34983398 | 0 |
| 487.46607821 | 0 |
| 487.58232639 | 0 |
| 487.69857852 | 0 |
| 487.8148346 | 0 |
| 487.93109463 | 0 |
| 488.0473586 | 0 |
| 488.16362652 | 0 |
| 488.27989838 | 0 |
| 488.39617418 | 0 |
| 488.51245392 | 0 |
| 488.6287376 | 0 |
| 488.74502521 | 0 |
| 488.86131676 | 0 |
| 488.97761224 | 0 |
| 489.09391165 | 0 |
| 489.210215 | 0 |
| 489.32652227 | 0 |
| 489.44283347 | 0 |
| 489.55914859 | 0 |
| 489.67546764 | 0 |
| 489.79179062 | 0 |
| 489.90811751 | 0 |
| 490.02444832 | 0 |
| 490.14078305 | 0 |
| 490.25712169 | 0 |
| 490.37346426 | 0 |
| 490.48981073 | 0 |
| 490.60616111 | 0 |
| 490.72251541 | 0 |
| 490.83887361 | 0 |
| 490.95523573 | 0 |
| 491.07160174 | 0 |
| 491.18797166 | 0 |
| 491.30434549 | 0 |
| 491.42072321 | 0 |
| 491.53710483 | 0 |
| 491.65349035 | 0 |
| 491.76987977 | 0 |
| 491.88627308 | 0 |
| 492.00267029 | 0 |
| 492.11907138 | 0 |
| 492.23547637 | 0 |
| 492.35188524 | 0 |
| 492.46829801 | 0 |
| 492.58471465 | 0 |
| 492.70113519 | 0 |
| 492.8175596 | 0 |
| 492.93398789 | 0 |
| 493.05042007 | 0 |
| 493.16685612 | 0 |
| 493.28329605 | 0 |
| 493.39973985 | 0 |
| 493.51618752 | 0 |
| 493.63263907 | 0 |
| 493.74909449 | 0 |
| 493.86555377 | 0 |
| 493.98201693 | 0 |
| 494.09848394 | 0 |
| 494.21495482 | 0 |
| 494.33142957 | 0 |
| 494.44790817 | 0 |
| 494.56439064 | 0 |
| 494.68087696 | 0 |
| 494.79736714 | 0 |
| 494.91386117 | 0 |
| 495.03035905 | 0 |
| 495.14686079 | 0 |
| 495.26336638 | 0 |
| 495.37987581 | 0 |
| 495.49638909 | 0 |
| 495.61290622 | 0 |
| 495.72942719 | 0 |
| 495.845952 | 0 |
| 495.96248066 | 0 |
| 496.07901315 | 0 |
| 496.19554948 | 0 |
| 496.31208965 | 0 |
| 496.42863365 | 0 |
| 496.54518149 | 0 |
| 496.66173315 | 0 |
| 496.77828865 | 0 |
| 496.89484797 | 0 |
| 497.01141112 | 0 |
| 497.1279781 | 0 |
| 497.2445489 | 0 |
| 497.36112352 | 0 |
| 497.47770196 | 0 |
| 497.59428422 | 0 |
| 497.7108703 | 0 |
| 497.8274602 | 0 |
| 497.94405391 | 0 |
| 498.06065143 | 0 |
| 498.17725277 | 0 |
| 498.29385791 | 0 |
| 498.41046686 | 0 |
| 498.52707962 | 0 |
| 498.64369619 | 0 |
| 498.76031656 | 0 |
| 498.87694073 | 0 |
| 498.9935687 | 0 |
| 499.11020047 | 0 |
| 499.22683603 | 0 |
| 499.3434754 | 0 |
| 499.46011856 | 0 |
| 499.57676551 | 0 |
| 499.69341625 | 0 |
| 499.81007078 | 0 |
| 499.9267291 | 0 |
| 500.04339121 | 0 |
| 500.1600571 | 0 |
| 500.27672677 | 0 |
| 500.39340023 | 0 |
| 500.51007747 | 0 |
| 500.62675849 | 0 |
| 500.74344328 | 0 |
| 500.86013185 | 0 |
| 500.9768242 | 0 |
| 501.09352032 | 0 |
| 501.21022021 | 0 |
| 501.32692387 | 0 |
| 501.44363129 | 0 |
| 501.56034249 | 0 |
| 501.67705745 | 0 |
| 501.79377617 | 0 |
| 501.91049865 | 0 |
| 502.0272249 | 0 |
| 502.1439549 | 0 |
| 502.26068866 | 0 |
| 502.37742618 | 0 |
| 502.49416745 | 0 |
| 502.61091248 | 0 |
| 502.72766125 | 0 |
| 502.84441378 | 0 |
| 502.96117005 | 0 |
| 503.07793007 | 0 |
| 503.19469384 | 0 |
| 503.31146135 | 0 |
| 503.4282326 | 0 |
| 503.54500759 | 0 |
| 503.66178632 | 0 |
| 503.77856879 | 0 |
| 503.89535499 | 0 |
| 504.01214493 | 0 |
| 504.1289386 | 0 |
| 504.245736 | 0 |
| 504.36253713 | 0 |
| 504.47934199 | 0 |
| 504.59615058 | 0 |
| 504.71296289 | 0 |
| 504.82977892 | 0 |
| 504.94659868 | 0 |
| 505.06342216 | 0 |
| 505.18024935 | 0 |
| 505.29708027 | 0 |
| 505.41391489 | 0 |
| 505.53075324 | 0 |
| 505.64759529 | 0 |
| 505.76444106 | 0 |
| 505.88129054 | 0 |
| 505.99814372 | 0 |
| 506.11500061 | 0 |
| 506.23186121 | 0 |
| 506.34872551 | 0 |
| 506.46559351 | 0 |
| 506.58246521 | 0 |
| 506.69934061 | 0 |
| 506.81621971 | 0 |
| 506.9331025 | 0 |
| 507.04998899 | 0 |
| 507.16687917 | 0 |
| 507.28377304 | 0 |
| 507.4006706 | 0 |
| 507.51757185 | 0 |
| 507.63447679 | 0 |
| 507.75138541 | 0 |
| 507.86829771 | 0 |
| 507.9852137 | 0 |
| 508.10213336 | 0 |
| 508.21905671 | 0 |
| 508.33598373 | 0 |
| 508.45291443 | 0 |
| 508.5698488 | 0 |
| 508.68678684 | 0 |
| 508.80372856 | 0 |
| 508.92067394 | 0 |
| 509.037623 | 0 |
| 509.15457572 | 0 |
| 509.2715321 | 0 |
| 509.38849215 | 0 |
| 509.50545586 | 0 |
| 509.62242323 | 0 |
| 509.73939426 | 0 |
| 509.85636894 | 0 |
| 509.97334728 | 0 |
| 510.09032928 | 0 |
| 510.20731492 | 0 |
| 510.32430422 | 0 |
| 510.44129717 | 0 |
| 510.55829377 | 0 |
| 510.67529401 | 0 |
| 510.7922979 | 0 |
| 510.90930543 | 0 |
| 511.0263166 | 0 |
| 511.14333141 | 0 |
| 511.26034986 | 0 |
| 511.37737195 | 0 |
| 511.49439768 | 0 |
| 511.61142703 | 0 |
| 511.72846002 | 0 |
| 511.84549664 | 0 |
| 511.9625369 | 0 |
| 512.07958077 | 0 |
| 512.19662828 | 0 |
| 512.31367941 | 0 |
| 512.43073416 | 0 |
| 512.54779254 | 0 |
| 512.66485453 | 0 |
| 512.78192014 | 0 |
| 512.89898937 | 0 |
| 513.01606222 | 0 |
| 513.13313868 | 0 |
| 513.25021875 | 0 |
| 513.36730244 | 0 |
| 513.48438973 | 0 |
| 513.60148063 | 0 |
| 513.71857514 | 0 |
| 513.83567325 | 0 |
| 513.95277496 | 0 |
| 514.06988028 | 0 |
| 514.18698919 | 0 |
| 514.30410171 | 0 |
| 514.42121782 | 0 |
| 514.53833753 | 0 |
| 514.65546083 | 0 |
| 514.77258772 | 0 |
| 514.88971821 | 0 |
| 515.00685228 | 0 |
| 515.12398994 | 0 |
| 515.24113119 | 0 |
| 515.35827602 | 0 |
| 515.47542444 | 0 |
| 515.59257644 | 0 |
| 515.70973201 | 0 |
| 515.82689117 | 0 |
| 515.9440539 | 0 |
| 516.06122021 | 0 |
| 516.17839009 | 0 |
| 516.29556355 | 0 |
| 516.41274057 | 0 |
| 516.52992117 | 0 |
| 516.64710533 | 0 |
| 516.76429306 | 0 |
| 516.88148435 | 0 |
| 516.99867921 | 0 |
| 517.11587762 | 0 |
| 517.2330796 | 0 |
| 517.35028514 | 0 |
| 517.46749423 | 0 |
| 517.58470688 | 0 |
| 517.70192308 | 0 |
| 517.81914284 | 0 |
| 517.93636614 | 0 |
| 518.053593 | 0 |
| 518.1708234 | 0 |
| 518.28805735 | 0 |
| 518.40529484 | 0 |
| 518.52253587 | 0 |
| 518.63978045 | 0 |
| 518.75702857 | 0 |
| 518.87428022 | 0 |
| 518.99153542 | 0 |
| 519.10879414 | 0 |
| 519.22605641 | 0 |
| 519.3433222 | 0 |
| 519.46059152 | 0 |
| 519.57786438 | 0 |
| 519.69514076 | 0 |
| 519.81242067 | 0 |
| 519.9297041 | 0 |
| 520.04699105 | 0 |
| 520.16428153 | 0 |
| 520.28157553 | 0 |
| 520.39887304 | 0 |
| 520.51617407 | 0 |
| 520.63347862 | 0 |
| 520.75078668 | 0 |
| 520.86809825 | 0 |
| 520.98541334 | 0 |
| 521.10273193 | 0 |
| 521.22005403 | 0 |
| 521.33737963 | 0 |
| 521.45470874 | 0 |
| 521.57204136 | 0 |
| 521.68937747 | 0 |
| 521.80671709 | 0 |
| 521.9240602 | 0 |
| 522.04140681 | 0 |
| 522.15875691 | 0 |
| 522.27611051 | 0 |
| 522.3934676 | 0 |
| 522.51082819 | 0 |
| 522.62819226 | 0 |
| 522.74555981 | 0 |
| 522.86293086 | 0 |
| 522.98030539 | 0 |
| 523.0976834 | 0 |
| 523.21506489 | 0 |
| 523.33244986 | 0 |
| 523.44983831 | 0 |
| 523.56723024 | 0 |
| 523.68462564 | 0 |
| 523.80202452 | 0 |
| 523.91942687 | 0 |
| 524.03683269 | 0 |
| 524.15424197 | 0 |
| 524.27165473 | 0 |
| 524.38907095 | 0 |
| 524.50649064 | 0 |
| 524.62391378 | 0 |
| 524.74134039 | 0 |
| 524.85877046 | 0 |
| 524.97620399 | 0 |
| 525.09364097 | 0 |
| 525.21108141 | 0 |
| 525.32852531 | 0 |
| 525.44597265 | 0 |
| 525.56342345 | 0 |
| 525.68087769 | 0 |
| 525.79833538 | 0 |
| 525.91579652 | 0 |
| 526.0332611 | 0 |
| 526.15072913 | 0 |
| 526.26820059 | 0 |
| 526.3856755 | 0 |
| 526.50315384 | 0 |
| 526.62063562 | 0 |
| 526.73812084 | 0 |
| 526.85560949 | 0 |
| 526.97310157 | 0 |
| 527.09059708 | 0 |
| 527.20809602 | 0 |
| 527.32559839 | 0 |
| 527.44310418 | 0 |
| 527.5606134 | 0 |
| 527.67812604 | 0 |
| 527.7956421 | 0 |
| 527.91316159 | 0 |
| 528.03068449 | 0 |
| 528.1482108 | 0 |
| 528.26574053 | 0 |
| 528.38327368 | 0 |
| 528.50081023 | 0 |
| 528.6183502 | 0 |
| 528.73589358 | 0 |
| 528.85344036 | 0 |
| 528.97099055 | 0 |
| 529.08854414 | 0 |
| 529.20610114 | 0 |
| 529.32366154 | 0 |
| 529.44122533 | 0 |
| 529.55879253 | 0 |
| 529.67636312 | 0 |
| 529.7939371 | 0 |
| 529.91151448 | 0 |
| 530.02909526 | 0 |
| 530.14667942 | 0 |
| 530.26426697 | 0 |
| 530.38185791 | 0 |
| 530.49945223 | 0 |
| 530.61704994 | 0 |
| 530.73465103 | 0 |
| 530.8522555 | 0 |
| 530.96986335 | 0 |
| 531.08747458 | 0 |
| 531.20508919 | 0 |
| 531.32270717 | 0 |
| 531.44032852 | 0 |
| 531.55795325 | 0 |
| 531.67558134 | 0 |
| 531.79321281 | 0 |
| 531.91084764 | 0 |
| 532.02848584 | 0 |
| 532.1461274 | 0 |
| 532.26377232 | 0 |
| 532.38142061 | 0 |
| 532.49907225 | 0 |
| 532.61672725 | 0 |
| 532.73438561 | 0 |
| 532.85204733 | 0 |
| 532.9697124 | 0 |
| 533.08738082 | 0 |
| 533.20505258 | 0 |
| 533.3227277 | 0 |
| 533.44040617 | 0 |
| 533.55808798 | 0 |
| 533.67577313 | 0 |
| 533.79346163 | 0 |
| 533.91115347 | 0 |
| 534.02884865 | 0 |
| 534.14654716 | 0 |
| 534.26424902 | 0 |
| 534.3819542 | 0 |
| 534.49966272 | 0 |
| 534.61737458 | 0 |
| 534.73508976 | 0 |
| 534.85280827 | 0 |
| 534.97053011 | 0 |
| 535.08825527 | 0 |
| 535.20598376 | 0 |
| 535.32371557 | 0 |
| 535.4414507 | 0 |
| 535.55918915 | 0 |
| 535.67693092 | 0 |
| 535.794676 | 0 |
| 535.9124244 | 0 |
| 536.03017612 | 0 |
| 536.14793114 | 0 |
| 536.26568948 | 0 |
| 536.38345112 | 0 |
| 536.50121607 | 0 |
| 536.61898432 | 0 |
| 536.73675588 | 0 |
| 536.85453075 | 0 |
| 536.97230891 | 0 |
| 537.09009037 | 0 |
| 537.20787513 | 0 |
| 537.32566319 | 0 |
| 537.44345454 | 0 |
| 537.56124918 | 0 |
| 537.67904712 | 0 |
| 537.79684835 | 0 |
| 537.91465286 | 0 |
| 538.03246066 | 0 |
| 538.15027175 | 0 |
| 538.26808612 | 0 |
| 538.38590377 | 0 |
| 538.50372471 | 0 |
| 538.62154892 | 0 |
| 538.73937641 | 0 |
| 538.85720718 | 0 |
| 538.97504122 | 0 |
| 539.09287854 | 0 |
| 539.21071912 | 0 |
| 539.32856298 | 0 |
| 539.44641011 | 0 |
| 539.5642605 | 0 |
| 539.68211416 | 0 |
| 539.79997108 | 0 |
| 539.91783126 | 0 |
| 540.03569471 | 0 |
| 540.15356141 | 0 |
| 540.27143137 | 0 |
| 540.38930459 | 0 |
| 540.50718106 | 0 |
| 540.62506079 | 0 |
| 540.74294377 | 0 |
| 540.86082999 | 0 |
| 540.97871947 | 0 |
| 541.09661219 | 0 |
| 541.21450816 | 0 |
| 541.33240737 | 0 |
| 541.45030983 | 0 |
| 541.56821552 | 0 |
| 541.68612445 | 0 |
| 541.80403663 | 0 |
| 541.92195203 | 0 |
| 542.03987068 | 0 |
| 542.15779255 | 0 |
| 542.27571766 | 0 |
| 542.393646 | 0 |
| 542.51157756 | 0 |
| 542.62951235 | 0 |
| 542.74745037 | 0 |
| 542.86539161 | 0 |
| 542.98333607 | 0 |
| 543.10128376 | 0 |
| 543.21923466 | 0 |
| 543.33718878 | 0 |
| 543.45514612 | 0 |
| 543.57310667 | 0 |
| 543.69107044 | 0 |
| 543.80903741 | 0 |
| 543.9270076 | 0 |
| 544.04498099 | 0 |
| 544.16295759 | 0 |
| 544.2809374 | 0 |
| 544.39892041 | 0 |
| 544.51690662 | 0 |
| 544.63489603 | 0 |
| 544.75288864 | 0 |
| 544.87088445 | 0 |
| 544.98888346 | 0 |
| 545.10688566 | 0 |
| 545.22489105 | 0 |
| 545.34289964 | 0 |
| 545.46091141 | 0 |
| 545.57892637 | 0 |
| 545.69694452 | 0 |
| 545.81496586 | 0 |
| 545.93299037 | 0 |
| 546.05101807 | 0 |
| 546.16904895 | 0 |
| 546.28708301 | 0 |
| 546.40512025 | 0 |
| 546.52316067 | 0 |
| 546.64120425 | 0 |
| 546.75925101 | 0 |
| 546.87730095 | 0 |
| 546.99535405 | 0 |
| 547.11341032 | 0 |
| 547.23146975 | 0 |
| 547.34953236 | 0 |
| 547.46759812 | 0 |
| 547.58566705 | 0 |
| 547.70373914 | 0 |
| 547.82181438 | 0 |
| 547.93989279 | 0 |
| 548.05797435 | 0 |
| 548.17605906 | 0 |
| 548.29414693 | 0 |
| 548.41223795 | 0 |
| 548.53033212 | 0 |
| 548.64842943 | 0 |
| 548.7665299 | 0 |
| 548.88463351 | 0 |
| 549.00274026 | 0 |
| 549.12085015 | 0 |
| 549.23896319 | 0 |
| 549.35707936 | 0 |
| 549.47519867 | 0 |
| 549.59332112 | 0 |
| 549.7114467 | 0 |
| 549.82957541 | 0 |
| 549.94770726 | 0 |
| 550.06584224 | 0 |
| 550.18398034 | 0 |
| 550.30212157 | 0 |
| 550.42026592 | 0 |
| 550.5384134 | 0 |
| 550.656564 | 0 |
| 550.77471772 | 0 |
| 550.89287456 | 0 |
| 551.01103452 | 0 |
| 551.12919759 | 0 |
| 551.24736378 | 0 |
| 551.36553308 | 0 |
| 551.48370549 | 0 |
| 551.60188101 | 0 |
| 551.72005964 | 0 |
| 551.83824137 | 0 |
| 551.95642621 | 0 |
| 552.07461416 | 0 |
| 552.1928052 | 0 |
| 552.31099935 | 0 |
| 552.42919659 | 0 |
| 552.54739694 | 0 |
| 552.66560038 | 0 |
| 552.78380691 | 0 |
| 552.90201653 | 0 |
| 553.02022925 | 0 |
| 553.13844505 | 0 |
| 553.25666395 | 0 |
| 553.37488593 | 0 |
| 553.49311099 | 0 |
| 553.61133914 | 0 |
| 553.72957037 | 0 |
| 553.84780468 | 0 |
| 553.96604207 | 0 |
| 554.08428254 | 0 |
| 554.20252608 | 0 |
| 554.3207727 | 0 |
| 554.43902239 | 0 |
| 554.55727515 | 0 |
| 554.67553098 | 0 |
| 554.79378988 | 0 |
| 554.91205184 | 0 |
| 555.03031687 | 0 |
| 555.14858496 | 0 |
| 555.26685612 | 0 |
| 555.38513033 | 0 |
| 555.50340761 | 0 |
| 555.62168794 | 0 |
| 555.73997132 | 0 |
| 555.85825777 | 0 |
| 555.97654726 | 0 |
| 556.0948398 | 0 |
| 556.2131354 | 0 |
| 556.33143404 | 0 |
| 556.44973573 | 0 |
| 556.56804046 | 0 |
| 556.68634824 | 0 |
| 556.80465905 | 0 |
| 556.92297291 | 0 |
| 557.04128981 | 0 |
| 557.15960974 | 0 |
| 557.27793271 | 0 |
| 557.39625872 | 0 |
| 557.51458775 | 0 |
| 557.63291982 | 0 |
| 557.75125492 | 0 |
| 557.86959304 | 0 |
| 557.98793419 | 0 |
| 558.10627837 | 0 |
| 558.22462557 | 0 |
| 558.34297579 | 0 |
| 558.46132903 | 0 |
| 558.57968529 | 0 |
| 558.69804457 | 0 |
| 558.81640686 | 0 |
| 558.93477217 | 0 |
| 559.05314049 | 0 |
| 559.17151182 | 0 |
| 559.28988615 | 0 |
| 559.4082635 | 0 |
| 559.52664386 | 0 |
| 559.64502721 | 0 |
| 559.76341358 | 0 |
| 559.88180294 | 0 |
| 560.0001953 | 0 |
| 560.11859066 | 0 |
| 560.23698902 | 0 |
| 560.35539038 | 0 |
| 560.47379472 | 0 |
| 560.59220207 | 0 |
| 560.7106124 | 0 |
| 560.82902572 | 0 |
| 560.94744203 | 0 |
| 561.06586132 | 0 |
| 561.1842836 | 0.001 |
| 561.30270887 | 0.002 |
| 561.42113711 | 0.002 |
| 561.53956833 | 0.003 |
| 561.65800254 | 0.004 |
| 561.77643972 | 0.005 |
| 561.89487987 | 0.006 |
| 562.013323 | 0.006 |
| 562.13176911 | 0.007 |
| 562.25021818 | 0.008 |
| 562.36867022 | 0.009 |
| 562.48712523 | 0.01 |
| 562.60558321 | 0.011 |
| 562.72404415 | 0.011 |
| 562.84250805 | 0.013 |
| 562.96097492 | 0.014 |
| 563.07944474 | 0.016 |
| 563.19791753 | 0.017 |
| 563.31639327 | 0.019 |
| 563.43487196 | 0.021 |
| 563.55335361 | 0.021 |
| 563.67183822 | 0.022 |
| 563.79032577 | 0.022 |
| 563.90881627 | 0.023 |
| 564.02730972 | 0.022 |
| 564.14580612 | 0.023 |
| 564.26430546 | 0.022 |
| 564.38280774 | 0.022 |
| 564.50131297 | 0.022 |
| 564.61982114 | 0.022 |
| 564.73833224 | 0.022 |
| 564.85684628 | 0.022 |
| 564.97536326 | 0.024 |
| 565.09388317 | 0.026 |
| 565.21240601 | 0.031 |
| 565.33093178 | 0.032 |
| 565.44946049 | 0.035 |
| 565.56799212 | 0.037 |
| 565.68652667 | 0.039 |
| 565.80506415 | 0.043 |
| 565.92360456 | 0.043 |
| 566.04214788 | 0.044 |
| 566.16069413 | 0.044 |
| 566.27924329 | 0.043 |
| 566.39779537 | 0.043 |
| 566.51635037 | 0.044 |
| 566.63490828 | 0.045 |
| 566.7534691 | 0.047 |
| 566.87203283 | 0.049 |
| 566.99059947 | 0.052 |
| 567.10916902 | 0.055 |
| 567.22774148 | 0.057 |
| 567.34631684 | 0.059 |
| 567.4648951 | 0.061 |
| 567.58347626 | 0.063 |
| 567.70206033 | 0.064 |
| 567.82064729 | 0.065 |
| 567.93923715 | 0.067 |
| 568.0578299 | 0.069 |
| 568.17642555 | 0.072 |
| 568.29502409 | 0.074 |
| 568.41362552 | 0.076 |
| 568.53222984 | 0.078 |
| 568.65083705 | 0.08 |
| 568.76944715 | 0.081 |
| 568.88806012 | 0.083 |
| 569.00667599 | 0.086 |
| 569.12529473 | 0.088 |
| 569.24391635 | 0.091 |
| 569.36254085 | 0.093 |
| 569.48116823 | 0.094 |
| 569.59979848 | 0.096 |
| 569.71843161 | 0.099 |
| 569.83706761 | 0.102 |
| 569.95570647 | 0.104 |
| 570.07434821 | 0.107 |
| 570.19299282 | 0.11 |
| 570.31164029 | 0.113 |
| 570.43029063 | 0.115 |
| 570.54894382 | 0.118 |
| 570.66759988 | 0.121 |
| 570.7862588 | 0.123 |
| 570.90492058 | 0.125 |
| 571.02358522 | 0.127 |
| 571.14225271 | 0.13 |
| 571.26092305 | 0.132 |
| 571.37959625 | 0.135 |
| 571.49827229 | 0.138 |
| 571.61695119 | 0.141 |
| 571.73563293 | 0.145 |
| 571.85431752 | 0.147 |
| 571.97300495 | 0.15 |
| 572.09169523 | 0.152 |
| 572.21038834 | 0.154 |
| 572.3290843 | 0.157 |
| 572.4477831 | 0.159 |
| 572.56648473 | 0.163 |
| 572.68518919 | 0.166 |
| 572.80389649 | 0.17 |
| 572.92260663 | 0.174 |
| 573.04131959 | 0.177 |
| 573.16003538 | 0.18 |
| 573.278754 | 0.185 |
| 573.39747545 | 0.189 |
| 573.51619972 | 0.193 |
| 573.63492681 | 0.197 |
| 573.75365672 | 0.201 |
| 573.87238945 | 0.205 |
| 573.99112501 | 0.208 |
| 574.10986337 | 0.211 |
| 574.22860456 | 0.215 |
| 574.34734855 | 0.219 |
| 574.46609536 | 0.223 |
| 574.58484498 | 0.227 |
| 574.70359741 | 0.232 |
| 574.82235264 | 0.236 |
| 574.94111068 | 0.24 |
| 575.05987153 | 0.244 |
| 575.17863518 | 0.248 |
| 575.29740162 | 0.252 |
| 575.41617087 | 0.256 |
| 575.53494292 | 0.26 |
| 575.65371776 | 0.264 |
| 575.7724954 | 0.267 |
| 575.89127583 | 0.272 |
| 576.01005906 | 0.277 |
| 576.12884507 | 0.281 |
| 576.24763387 | 0.286 |
| 576.36642546 | 0.291 |
| 576.48521984 | 0.297 |
| 576.604017 | 0.303 |
| 576.72281694 | 0.308 |
| 576.84161967 | 0.314 |
| 576.96042517 | 0.319 |
| 577.07923345 | 0.326 |
| 577.19804451 | 0.331 |
| 577.31685834 | 0.337 |
| 577.43567495 | 0.343 |
| 577.55449433 | 0.349 |
| 577.67331648 | 0.354 |
| 577.7921414 | 0.358 |
| 577.91096908 | 0.363 |
| 578.02979953 | 0.367 |
| 578.14863275 | 0.374 |
| 578.26746872 | 0.382 |
| 578.38630746 | 0.388 |
| 578.50514896 | 0.393 |
| 578.62399322 | 0.398 |
| 578.74284023 | 0.405 |
| 578.86168999 | 0.411 |
| 578.98054252 | 0.417 |
| 579.09939779 | 0.422 |
| 579.21825581 | 0.43 |
| 579.33711658 | 0.437 |
| 579.4559801 | 0.444 |
| 579.57484637 | 0.451 |
| 579.69371537 | 0.458 |
| 579.81258712 | 0.465 |
| 579.93146162 | 0.473 |
| 580.05033885 | 0.483 |
| 580.16921882 | 0.492 |
| 580.28810152 | 0.503 |
| 580.40698696 | 0.508 |
| 580.52587514 | 0.515 |
| 580.64476604 | 0.52 |
| 580.76365968 | 0.525 |
| 580.88255605 | 0.531 |
| 581.00145514 | 0.541 |
| 581.12035696 | 0.551 |
| 581.2392615 | 0.562 |
| 581.35816876 | 0.571 |
| 581.47707875 | 0.578 |
| 581.59599145 | 0.583 |
| 581.71490687 | 0.588 |
| 581.83382501 | 0.594 |
| 581.95274587 | 0.603 |
| 582.07166943 | 0.613 |
| 582.19059571 | 0.622 |
| 582.3095247 | 0.632 |
| 582.4284564 | 0.642 |
| 582.5473908 | 0.651 |
| 582.66632791 | 0.659 |
| 582.78526773 | 0.667 |
| 582.90421024 | 0.676 |
| 583.02315546 | 0.685 |
| 583.14210338 | 0.694 |
| 583.26105399 | 0.701 |
| 583.3800073 | 0.707 |
| 583.49896331 | 0.712 |
| 583.61792201 | 0.72 |
| 583.7368834 | 0.729 |
| 583.85584748 | 0.74 |
| 583.97481425 | 0.749 |
| 584.09378371 | 0.758 |
| 584.21275585 | 0.764 |
| 584.33173067 | 0.772 |
| 584.45070818 | 0.779 |
| 584.56968837 | 0.79 |
| 584.68867124 | 0.799 |
| 584.80765679 | 0.809 |
| 584.92664501 | 0.818 |
| 585.04563591 | 0.83 |
| 585.16462948 | 0.839 |
| 585.28362572 | 0.849 |
| 585.40262463 | 0.854 |
| 585.52162621 | 0.86 |
| 585.64063046 | 0.866 |
| 585.75963737 | 0.877 |
| 585.87864695 | 0.888 |
| 585.99765919 | 0.9 |
| 586.11667409 | 0.909 |
| 586.23569165 | 0.918 |
| 586.35471187 | 0.922 |
| 586.47373474 | 0.926 |
| 586.59276027 | 0.931 |
| 586.71178845 | 0.939 |
| 586.83081928 | 0.945 |
| 586.94985277 | 0.949 |
| 587.0688889 | 0.955 |
| 587.18792768 | 0.962 |
| 587.3069691 | 0.968 |
| 587.42601317 | 0.974 |
| 587.54505988 | 0.978 |
| 587.66410923 | 0.982 |
| 587.78316122 | 0.983 |
| 587.90221585 | 0.985 |
| 588.02127311 | 0.986 |
| 588.14033301 | 0.99 |
| 588.25939554 | 0.993 |
| 588.37846071 | 0.994 |
| 588.4975285 | 0.995 |
| 588.61659892 | 0.996 |
| 588.73567197 | 0.997 |
| 588.85474764 | 0.999 |
| 588.97382594 | 0.999 |
| 589.09290686 | 1 |
| 589.2119904 | 0.998 |
| 589.33107656 | 0.996 |
| 589.45016534 | 0.993 |
| 589.56925673 | 0.992 |
| 589.68835074 | 0.991 |
| 589.80744736 | 0.99 |
| 589.92654659 | 0.986 |
| 590.04564844 | 0.983 |
| 590.16475289 | 0.978 |
| 590.28385994 | 0.973 |
| 590.40296961 | 0.965 |
| 590.52208187 | 0.958 |
| 590.64119674 | 0.949 |
| 590.76031421 | 0.939 |
| 590.87943428 | 0.926 |
| 590.99855695 | 0.917 |
| 591.11768221 | 0.906 |
| 591.23681007 | 0.897 |
| 591.35594052 | 0.887 |
| 591.47507356 | 0.876 |
| 591.59420919 | 0.862 |
| 591.71334741 | 0.849 |
| 591.83248822 | 0.835 |
| 591.95163161 | 0.822 |
| 592.07077758 | 0.807 |
| 592.18992614 | 0.793 |
| 592.30907728 | 0.778 |
| 592.428231 | 0.763 |
| 592.54738729 | 0.748 |
| 592.66654616 | 0.735 |
| 592.78570761 | 0.723 |
| 592.90487163 | 0.711 |
| 593.02403822 | 0.696 |
| 593.14320738 | 0.68 |
| 593.2623791 | 0.664 |
| 593.3815534 | 0.652 |
| 593.50073026 | 0.638 |
| 593.61990968 | 0.625 |
| 593.73909167 | 0.61 |
| 593.85827621 | 0.595 |
| 593.97746332 | 0.58 |
| 594.09665298 | 0.566 |
| 594.2158452 | 0.552 |
| 594.33503997 | 0.538 |
| 594.4542373 | 0.525 |
| 594.57343718 | 0.512 |
| 594.6926396 | 0.499 |
| 594.81184458 | 0.485 |
| 594.9310521 | 0.471 |
| 595.05026217 | 0.458 |
| 595.16947478 | 0.446 |
| 595.28868993 | 0.434 |
| 595.40790762 | 0.423 |
| 595.52712786 | 0.411 |
| 595.64635063 | 0.4 |
| 595.76557593 | 0.389 |
| 595.88480377 | 0.379 |
| 596.00403415 | 0.369 |
| 596.12326705 | 0.359 |
| 596.24250248 | 0.35 |
| 596.36174045 | 0.34 |
| 596.48098093 | 0.331 |
| 596.60022395 | 0.322 |
| 596.71946949 | 0.314 |
| 596.83871754 | 0.306 |
| 596.95796812 | 0.298 |
| 597.07722122 | 0.289 |
| 597.19647684 | 0.281 |
| 597.31573497 | 0.273 |
| 597.43499562 | 0.266 |
| 597.55425878 | 0.258 |
| 597.67352445 | 0.252 |
| 597.79279263 | 0.245 |
| 597.91206332 | 0.239 |
| 598.03133651 | 0.231 |
| 598.15061221 | 0.225 |
| 598.26989041 | 0.218 |
| 598.38917112 | 0.212 |
| 598.50845432 | 0.205 |
| 598.62774003 | 0.199 |
| 598.74702823 | 0.193 |
| 598.86631893 | 0.188 |
| 598.98561212 | 0.181 |
| 599.10490781 | 0.176 |
| 599.22420598 | 0.17 |
| 599.34350665 | 0.166 |
| 599.4628098 | 0.161 |
| 599.58211544 | 0.156 |
| 599.70142357 | 0.152 |
| 599.82073418 | 0.148 |
| 599.94004727 | 0.143 |
| 600.05936284 | 0.138 |
| 600.17868089 | 0.132 |
| 600.29800141 | 0.128 |
| 600.41732442 | 0.123 |
| 600.53664989 | 0.12 |
| 600.65597784 | 0.116 |
| 600.77530826 | 0.112 |
| 600.89464115 | 0.109 |
| 601.01397651 | 0.105 |
| 601.13331434 | 0.101 |
| 601.25265463 | 0.098 |
| 601.37199738 | 0.094 |
| 601.4913426 | 0.091 |
| 601.61069027 | 0.087 |
| 601.73004041 | 0.084 |
| 601.849393 | 0.081 |
| 601.96874805 | 0.078 |
| 602.08810555 | 0.075 |
| 602.2074655 | 0.072 |
| 602.32682791 | 0.07 |
| 602.44619276 | 0.067 |
| 602.56556006 | 0.064 |
| 602.68492981 | 0.061 |
| 602.80430201 | 0.058 |
| 602.92367664 | 0.055 |
| 603.04305372 | 0.051 |
| 603.16243324 | 0.047 |
| 603.2818152 | 0.044 |
| 603.4011996 | 0.044 |
| 603.52058643 | 0.043 |
| 603.63997569 | 0.042 |
| 603.75936739 | 0.04 |
| 603.87876152 | 0.037 |
| 603.99815808 | 0.035 |
| 604.11755706 | 0.032 |
| 604.23695848 | 0.027 |
| 604.35636231 | 0.023 |
| 604.47576857 | 0.022 |
| 604.59517726 | 0.022 |
| 604.71458836 | 0.023 |
| 604.83400188 | 0.023 |
| 604.95341782 | 0.023 |
| 605.07283617 | 0.022 |
| 605.19225694 | 0.022 |
| 605.31168012 | 0.021 |
| 605.43110572 | 0.019 |
| 605.55053372 | 0.018 |
| 605.66996413 | 0.015 |
| 605.78939694 | 0.014 |
| 605.90883216 | 0.011 |
| 606.02826979 | 0.01 |
| 606.14770981 | 0.009 |
| 606.26715224 | 0.008 |
| 606.38659706 | 0.006 |
| 606.50604428 | 0.006 |
| 606.6254939 | 0.004 |
| 606.74494591 | 0.004 |
| 606.86440031 | 0.002 |
| 606.98385711 | 0.002 |
| 607.10331629 | 0.001 |
| 607.22277786 | 0.001 |
| 607.34224182 | 0 |
| 607.46170816 | 0 |
| 607.58117689 | 0 |
| 607.70064799 | 0 |
| 607.82012148 | 0 |
| 607.93959735 | 0 |
| 608.05907559 | 0 |
| 608.17855621 | 0 |
| 608.2980392 | 0 |
| 608.41752457 | 0 |
| 608.5370123 | 0 |
| 608.65650241 | 0 |
| 608.77599488 | 0 |
| 608.89548972 | 0 |
| 609.01498692 | 0 |
| 609.13448649 | 0 |
| 609.25398842 | 0 |
| 609.37349271 | 0 |
| 609.49299935 | 0 |
| 609.61250836 | 0 |
| 609.73201972 | 0 |
| 609.85153343 | 0 |
| 609.9710495 | 0 |
| 610.09056791 | 0 |
| 610.21008868 | 0 |
| 610.32961179 | 0 |
| 610.44913725 | 0 |
| 610.56866506 | 0 |
| 610.68819521 | 0 |
| 610.8077277 | 0 |
| 610.92726253 | 0 |
| 611.04679969 | 0 |
| 611.1663392 | 0 |
| 611.28588104 | 0 |
| 611.40542521 | 0 |
| 611.52497172 | 0 |
| 611.64452056 | 0 |
| 611.76407172 | 0 |
| 611.88362522 | 0 |
| 612.00318104 | 0 |
| 612.12273918 | 0 |
| 612.24229965 | 0 |
| 612.36186244 | 0 |
| 612.48142755 | 0 |
| 612.60099498 | 0 |
| 612.72056472 | 0 |
| 612.84013678 | 0 |
| 612.95971116 | 0 |
| 613.07928784 | 0 |
| 613.19886684 | 0 |
| 613.31844815 | 0 |
| 613.43803176 | 0 |
| 613.55761768 | 0 |
| 613.6772059 | 0 |
| 613.79679643 | 0 |
| 613.91638926 | 0 |
| 614.03598439 | 0 |
| 614.15558182 | 0 |
| 614.27518154 | 0 |
| 614.39478356 | 0 |
| 614.51438787 | 0 |
| 614.63399448 | 0 |
| 614.75360337 | 0 |
| 614.87321456 | 0 |
| 614.99282803 | 0 |
| 615.11244379 | 0 |
| 615.23206183 | 0 |
| 615.35168216 | 0 |
| 615.47130477 | 0 |
| 615.59092966 | 0 |
| 615.71055682 | 0 |
| 615.83018626 | 0 |
| 615.94981798 | 0 |
| 616.06945197 | 0 |
| 616.18908824 | 0 |
| 616.30872677 | 0 |
| 616.42836758 | 0 |
| 616.54801065 | 0 |
| 616.66765598 | 0 |
| 616.78730358 | 0 |
| 616.90695345 | 0 |
| 617.02660557 | 0 |
| 617.14625996 | 0 |
| 617.2659166 | 0 |
| 617.38557551 | 0 |
| 617.50523666 | 0 |
| 617.62490007 | 0 |
| 617.74456573 | 0 |
| 617.86423364 | 0 |
| 617.98390381 | 0 |
| 618.10357621 | 0 |
| 618.22325087 | 0 |
| 618.34292777 | 0 |
| 618.46260691 | 0 |
| 618.58228829 | 0 |
| 618.70197192 | 0 |
| 618.82165778 | 0 |
| 618.94134588 | 0 |
| 619.06103621 | 0 |
| 619.18072878 | 0 |
| 619.30042357 | 0 |
| 619.4201206 | 0 |
| 619.53981986 | 0 |
| 619.65952135 | 0 |
| 619.77922506 | 0 |
| 619.898931 | 0 |
| 620.01863915 | 0 |
| 620.13834953 | 0 |
| 620.25806213 | 0 |
| 620.37777695 | 0 |
| 620.49749399 | 0 |
| 620.61721324 | 0 |
| 620.7369347 | 0 |
| 620.85665837 | 0 |
| 620.97638426 | 0 |
| 621.09611236 | 0 |
| 621.21584266 | 0 |
| 621.33557517 | 0 |
| 621.45530988 | 0 |
| 621.57504679 | 0 |
| 621.69478591 | 0 |
| 621.81452723 | 0 |
| 621.93427074 | 0 |
| 622.05401645 | 0 |
| 622.17376436 | 0 |
| 622.29351445 | 0 |
| 622.41326675 | 0 |
| 622.53302123 | 0 |
| 622.6527779 | 0 |
| 622.77253676 | 0 |
| 622.8922978 | 0 |
| 623.01206103 | 0 |
| 623.13182644 | 0 |
| 623.25159403 | 0 |
| 623.3713638 | 0 |
| 623.49113575 | 0 |
| 623.61090988 | 0 |
| 623.73068618 | 0 |
| 623.85046465 | 0 |
| 623.9702453 | 0 |
| 624.09002812 | 0 |
| 624.2098131 | 0 |
| 624.32960025 | 0 |
| 624.44938957 | 0 |
| 624.56918106 | 0 |
| 624.6889747 | 0 |
| 624.80877051 | 0 |
| 624.92856847 | 0 |
| 625.0483686 | 0 |
| 625.16817088 | 0 |
| 625.28797531 | 0 |
| 625.4077819 | 0 |
| 625.52759064 | 0 |
| 625.64740154 | 0 |
| 625.76721458 | 0 |
| 625.88702976 | 0 |
| 626.0068471 | 0 |
| 626.12666657 | 0 |
| 626.24648819 | 0 |
| 626.36631195 | 0 |
| 626.48613785 | 0 |
| 626.60596589 | 0 |
| 626.72579607 | 0 |
| 626.84562838 | 0 |
| 626.96546282 | 0 |
| 627.0852994 | 0 |
| 627.2051381 | 0 |
| 627.32497893 | 0 |
| 627.4448219 | 0 |
| 627.56466698 | 0 |
| 627.68451419 | 0 |
| 627.80436353 | 0 |
| 627.92421498 | 0 |
| 628.04406855 | 0 |
| 628.16392425 | 0 |
| 628.28378205 | 0 |
| 628.40364198 | 0 |
| 628.52350401 | 0 |
| 628.64336816 | 0 |
| 628.76323442 | 0 |
| 628.88310279 | 0 |
| 629.00297326 | 0 |
| 629.12284584 | 0 |
| 629.24272053 | 0 |
| 629.36259731 | 0 |
| 629.4824762 | 0 |
| 629.60235719 | 0 |
| 629.72224027 | 0 |
| 629.84212545 | 0 |
| 629.96201273 | 0 |
| 630.0819021 | 0 |
| 630.20179356 | 0 |
| 630.32168711 | 0 |
| 630.44158275 | 0 |
| 630.56148047 | 0 |
| 630.68138029 | 0 |
| 630.80128218 | 0 |
| 630.92118616 | 0 |
| 631.04109222 | 0 |
| 631.16100036 | 0 |
| 631.28091058 | 0 |
| 631.40082287 | 0 |
| 631.52073724 | 0 |
| 631.64065368 | 0 |
| 631.76057219 | 0 |
| 631.88049277 | 0 |
| 632.00041543 | 0 |
| 632.12034014 | 0 |
| 632.24026693 | 0 |
| 632.36019578 | 0 |
| 632.48012669 | 0 |
| 632.60005966 | 0 |
| 632.71999469 | 0 |
| 632.83993178 | 0 |
| 632.95987092 | 0 |
| 633.07981212 | 0 |
| 633.19975537 | 0 |
| 633.31970068 | 0 |
| 633.43964803 | 0 |
| 633.55959743 | 0 |
| 633.67954888 | 0 |
| 633.79950238 | 0 |
| 633.91945792 | 0 |
| 634.0394155 | 0 |
| 634.15937512 | 0 |
| 634.27933678 | 0 |
| 634.39930048 | 0 |
| 634.51926622 | 0 |
| 634.63923399 | 0 |
| 634.75920379 | 0 |
| 634.87917562 | 0 |
| 634.99914949 | 0 |
| 635.11912538 | 0 |
| 635.2391033 | 0 |
| 635.35908325 | 0 |
| 635.47906522 | 0 |
| 635.59904921 | 0 |
| 635.71903522 | 0 |
| 635.83902325 | 0 |
| 635.9590133 | 0 |
| 636.07900537 | 0 |
| 636.19899945 | 0 |
| 636.31899554 | 0 |
| 636.43899365 | 0 |
| 636.55899376 | 0 |
| 636.67899588 | 0 |
| 636.79900001 | 0 |
| 636.91900615 | 0 |
| 637.03901429 | 0 |
| 637.15902443 | 0 |
| 637.27903657 | 0 |
| 637.39905071 | 0 |
| 637.51906685 | 0 |
| 637.63908499 | 0 |
| 637.75910512 | 0 |
| 637.87912724 | 0 |
| 637.99915135 | 0 |
| 638.11917746 | 0 |
| 638.23920555 | 0 |
| 638.35923563 | 0 |
| 638.47926769 | 0 |
| 638.59930174 | 0 |
| 638.71933777 | 0 |
| 638.83937578 | 0 |
| 638.95941577 | 0 |
| 639.07945774 | 0 |
| 639.19950169 | 0 |
| 639.3195476 | 0 |
| 639.4395955 | 0 |
| 639.55964536 | 0 |
| 639.67969719 | 0 |
| 639.79975099 | 0 |
| 639.91980676 | 0 |
| 640.03986449 | 0 |
| 640.15992419 | 0 |
| 640.27998585 | 0 |
| 640.40004947 | 0 |
| 640.52011505 | 0 |
| 640.64018258 | 0 |
| 640.76025207 | 0 |
| 640.88032352 | 0 |
| 641.00039692 | 0 |
| 641.12047227 | 0 |
| 641.24054957 | 0 |
| 641.36062882 | 0 |
| 641.48071002 | 0 |
| 641.60079316 | 0 |
| 641.72087824 | 0 |
| 641.84096527 | 0 |
| 641.96105424 | 0 |
| 642.08114514 | 0 |
| 642.20123799 | 0 |
| 642.32133276 | 0 |
| 642.44142948 | 0 |
| 642.56152813 | 0 |
| 642.6816287 | 0 |
| 642.80173121 | 0 |
| 642.92183565 | 0 |
| 643.04194201 | 0 |
| 643.1620503 | 0 |
| 643.28216051 | 0 |
| 643.40227264 | 0 |
| 643.5223867 | 0 |
| 643.64250267 | 0 |
| 643.76262056 | 0 |
| 643.88274037 | 0 |
| 644.00286209 | 0 |
| 644.12298572 | 0 |
| 644.24311127 | 0 |
| 644.36323872 | 0 |
| 644.48336809 | 0 |
| 644.60349936 | 0 |
| 644.72363253 | 0 |
| 644.84376761 | 0 |
| 644.96390459 | 0 |
| 645.08404347 | 0 |
| 645.20418425 | 0 |
| 645.32432693 | 0 |
| 645.4444715 | 0 |
| 645.56461797 | 0 |
| 645.68476633 | 0 |
| 645.80491658 | 0 |
| 645.92506872 | 0 |
| 646.04522275 | 0 |
| 646.16537866 | 0 |
| 646.28553646 | 0 |
| 646.40569615 | 0 |
| 646.52585771 | 0 |
| 646.64602116 | 0 |
| 646.76618648 | 0 |
| 646.88635369 | 0 |
| 647.00652276 | 0 |
| 647.12669372 | 0 |
| 647.24686654 | 0 |
| 647.36704124 | 0 |
| 647.48721781 | 0 |
| 647.60739624 | 0 |
| 647.72757654 | 0 |
| 647.84775871 | 0 |
| 647.96794274 | 0 |
| 648.08812863 | 0 |
| 648.20831638 | 0 |
| 648.32850599 | 0 |
| 648.44869746 | 0 |
| 648.56889078 | 0 |
| 648.68908596 | 0 |
| 648.80928299 | 0 |
| 648.92948187 | 0 |
| 649.0496826 | 0 |
| 649.16988518 | 0 |
| 649.2900896 | 0 |
| 649.41029587 | 0 |
| 649.53050399 | 0 |
| 649.65071394 | 0 |
| 649.77092574 | 0 |
| 649.89113937 | 0 |
| 650.01135485 | 0 |
| 650.13157215 | 0 |
| 650.2517913 | 0 |
| 650.37201227 | 0 |
| 650.49223507 | 0 |
| 650.61245971 | 0 |
| 650.73268617 | 0 |
| 650.85291446 | 0 |
| 650.97314458 | 0 |
| 651.09337651 | 0 |
| 651.21361027 | 0 |
| 651.33384585 | 0 |
| 651.45408325 | 0 |
| 651.57432247 | 0 |
| 651.6945635 | 0 |
| 651.81480634 | 0 |
| 651.935051 | 0 |
| 652.05529747 | 0 |
| 652.17554575 | 0 |
| 652.29579584 | 0 |
| 652.41604773 | 0 |
| 652.53630143 | 0 |
| 652.65655693 | 0 |
| 652.77681423 | 0 |
| 652.89707333 | 0 |
| 653.01733423 | 0 |
| 653.13759693 | 0 |
| 653.25786143 | 0 |
| 653.37812772 | 0 |
| 653.4983958 | 0 |
| 653.61866567 | 0 |
| 653.73893733 | 0 |
| 653.85921078 | 0 |
| 653.97948601 | 0 |
| 654.09976303 | 0 |
| 654.22004184 | 0 |
| 654.34032242 | 0 |
| 654.46060479 | 0 |
| 654.58088893 | 0 |
| 654.70117485 | 0 |
| 654.82146255 | 0 |
| 654.94175202 | 0 |
| 655.06204326 | 0 |
| 655.18233628 | 0 |
| 655.30263106 | 0 |
| 655.42292761 | 0 |
| 655.54322593 | 0 |
| 655.66352601 | 0 |
| 655.78382786 | 0 |
| 655.90413146 | 0 |
| 656.02443683 | 0 |
| 656.14474396 | 0 |
| 656.26505284 | 0 |
| 656.38536348 | 0 |
| 656.50567587 | 0 |
| 656.62599001 | 0 |
| 656.74630591 | 0 |
| 656.86662356 | 0 |
| 656.98694295 | 0 |
| 657.10726409 | 0 |
| 657.22758697 | 0 |
| 657.3479116 | 0 |
| 657.46823797 | 0 |
| 657.58856607 | 0 |
| 657.70889592 | 0 |
| 657.8292275 | 0 |
| 657.94956082 | 0 |
| 658.06989588 | 0 |
| 658.19023266 | 0 |
| 658.31057118 | 0 |
| 658.43091142 | 0 |
| 658.5512534 | 0 |
| 658.6715971 | 0 |
| 658.79194252 | 0 |
| 658.91228967 | 0 |
| 659.03263854 | 0 |
| 659.15298913 | 0 |
| 659.27334143 | 0 |
| 659.39369546 | 0 |
| 659.5140512 | 0 |
| 659.63440865 | 0 |
| 659.75476782 | 0 |
| 659.87512869 | 0 |
| 659.99549128 | 0 |
| 660.11585557 | 0 |
| 660.23622157 | 0 |
| 660.35658928 | 0 |
| 660.47695869 | 0 |
| 660.59732979 | 0 |
| 660.7177026 | 0 |
| 660.83807711 | 0 |
| 660.95845331 | 0 |
| 661.07883121 | 0 |
| 661.19921081 | 0 |
| 661.31959209 | 0 |
| 661.43997507 | 0 |
| 661.56035973 | 0 |
| 661.68074609 | 0 |
| 661.80113413 | 0 |
| 661.92152385 | 0 |
| 662.04191526 | 0 |
| 662.16230834 | 0 |
| 662.28270311 | 0 |
| 662.40309956 | 0 |
| 662.52349768 | 0 |
| 662.64389748 | 0 |
| 662.76429895 | 0 |
| 662.8847021 | 0 |
| 663.00510691 | 0 |
| 663.1255134 | 0 |
| 663.24592155 | 0 |
| 663.36633137 | 0 |
| 663.48674285 | 0 |
| 663.60715599 | 0 |
| 663.7275708 | 0 |
| 663.84798727 | 0 |
| 663.96840539 | 0 |
| 664.08882517 | 0 |
| 664.20924661 | 0 |
| 664.3296697 | 0 |
| 664.45009445 | 0 |
| 664.57052084 | 0 |
| 664.69094888 | 0 |
| 664.81137857 | 0 |
| 664.93180991 | 0 |
| 665.05224289 | 0 |
| 665.17267751 | 0 |
| 665.29311378 | 0 |
| 665.41355168 | 0 |
| 665.53399122 | 0 |
| 665.6544324 | 0 |
| 665.77487522 | 0 |
| 665.89531967 | 0 |
| 666.01576575 | 0 |
| 666.13621346 | 0 |
| 666.2566628 | 0 |
| 666.37711377 | 0 |
| 666.49756636 | 0 |
| 666.61802058 | 0 |
| 666.73847642 | 0 |
| 666.85893388 | 0 |
| 666.97939296 | 0 |
| 667.09985366 | 0 |
| 667.22031598 | 0 |
| 667.34077991 | 0 |
| 667.46124546 | 0 |
| 667.58171261 | 0 |
| 667.70218138 | 0 |
| 667.82265176 | 0 |
| 667.94312374 | 0 |
| 668.06359733 | 0 |
| 668.18407253 | 0 |
| 668.30454933 | 0 |
| 668.42502772 | 0 |
| 668.54550772 | 0 |
| 668.66598932 | 0 |
| 668.78647251 | 0 |
| 668.9069573 | 0 |
| 669.02744368 | 0 |
| 669.14793166 | 0 |
| 669.26842122 | 0 |
| 669.38891237 | 0 |
| 669.50940511 | 0 |
| 669.62989944 | 0 |
| 669.75039535 | 0 |
| 669.87089285 | 0 |
| 669.99139192 | 0 |
| 670.11189257 | 0 |
| 670.23239481 | 0 |
| 670.35289862 | 0 |
| 670.473404 | 0 |
| 670.59391096 | 0 |
| 670.71441949 | 0 |
| 670.83492959 | 0 |
| 670.95544126 | 0 |
| 671.07595449 | 0 |
| 671.1964693 | 0 |
| 671.31698566 | 0 |
| 671.43750359 | 0 |
| 671.55802308 | 0 |
| 671.67854413 | 0 |
| 671.79906674 | 0 |
| 671.9195909 | 0 |
| 672.04011662 | 0 |
| 672.1606439 | 0 |
| 672.28117272 | 0 |
| 672.40170309 | 0 |
| 672.52223502 | 0 |
| 672.64276849 | 0 |
| 672.76330351 | 0 |
| 672.88384007 | 0 |
| 673.00437817 | 0 |
| 673.12491782 | 0 |
| 673.245459 | 0 |
| 673.36600172 | 0 |
| 673.48654598 | 0 |
| 673.60709178 | 0 |
| 673.7276391 | 0 |
| 673.84818796 | 0 |
| 673.96873835 | 0 |
| 674.08929027 | 0 |
| 674.20984372 | 0 |
| 674.33039869 | 0 |
| 674.45095518 | 0 |
| 674.5715132 | 0 |
| 674.69207274 | 0 |
| 674.8126338 | 0 |
| 674.93319637 | 0 |
| 675.05376047 | 0 |
| 675.17432607 | 0 |
| 675.2948932 | 0 |
| 675.41546183 | 0 |
| 675.53603197 | 0 |
| 675.65660362 | 0 |
| 675.77717678 | 0 |
| 675.89775145 | 0 |
| 676.01832762 | 0 |
| 676.13890529 | 0 |
| 676.25948446 | 0 |
| 676.38006513 | 0 |
| 676.5006473 | 0 |
| 676.62123097 | 0 |
| 676.74181613 | 0 |
| 676.86240278 | 0 |
| 676.98299093 | 0 |
| 677.10358057 | 0 |
| 677.22417169 | 0 |
| 677.3447643 | 0 |
| 677.4653584 | 0 |
| 677.58595398 | 0 |
| 677.70655105 | 0 |
| 677.82714959 | 0 |
| 677.94774962 | 0 |
| 678.06835112 | 0 |
| 678.1889541 | 0 |
| 678.30955855 | 0 |
| 678.43016448 | 0 |
| 678.55077188 | 0 |
| 678.67138074 | 0 |
| 678.79199108 | 0 |
| 678.91260289 | 0 |
| 679.03321616 | 0 |
| 679.15383089 | 0 |
| 679.27444709 | 0 |
| 679.39506474 | 0 |
| 679.51568386 | 0 |
| 679.63630443 | 0 |
| 679.75692647 | 0 |
| 679.87754995 | 0 |
| 679.99817489 | 0 |
| 680.11880128 | 0 |
| 680.23942912 | 0 |
| 680.36005841 | 0 |
| 680.48068915 | 0 |
| 680.60132133 | 0 |
| 680.72195495 | 0 |
| 680.84259002 | 0 |
| 680.96322653 | 0 |
| 681.08386448 | 0 |
| 681.20450386 | 0 |
| 681.32514469 | 0 |
| 681.44578694 | 0 |
| 681.56643063 | 0 |
| 681.68707575 | 0 |
| 681.8077223 | 0 |
| 681.92837028 | 0 |
| 682.04901969 | 0 |
| 682.16967052 | 0 |
| 682.29032278 | 0 |
| 682.41097646 | 0 |
| 682.53163156 | 0 |
| 682.65228808 | 0 |
| 682.77294601 | 0 |
| 682.89360537 | 0 |
| 683.01426613 | 0 |
| 683.13492832 | 0 |
| 683.25559191 | 0 |
| 683.37625691 | 0 |
| 683.49692332 | 0 |
| 683.61759114 | 0 |
| 683.73826036 | 0 |
| 683.85893099 | 0 |
| 683.97960302 | 0 |
| 684.10027645 | 0 |
| 684.22095127 | 0 |
| 684.3416275 | 0 |
| 684.46230512 | 0 |
| 684.58298414 | 0 |
| 684.70366455 | 0 |
| 684.82434635 | 0 |
| 684.94502954 | 0 |
| 685.06571413 | 0 |
| 685.18640009 | 0 |
| 685.30708744 | 0 |
| 685.42777618 | 0 |
| 685.5484663 | 0 |
| 685.6691578 | 0 |
| 685.78985068 | 0 |
| 685.91054493 | 0 |
| 686.03124057 | 0 |
| 686.15193757 | 0 |
| 686.27263595 | 0 |
| 686.3933357 | 0 |
| 686.51403682 | 0 |
| 686.63473931 | 0 |
| 686.75544317 | 0 |
| 686.87614839 | 0 |
| 686.99685498 | 0 |
| 687.11756292 | 0 |
| 687.23827223 | 0 |
| 687.3589829 | 0 |
| 687.47969492 | 0 |
| 687.6004083 | 0 |
| 687.72112304 | 0 |
| 687.84183913 | 0 |
| 687.96255657 | 0 |
| 688.08327536 | 0 |
| 688.2039955 | 0 |
| 688.32471698 | 0 |
| 688.44543981 | 0 |
| 688.56616398 | 0 |
| 688.6868895 | 0 |
| 688.80761636 | 0 |
| 688.92834455 | 0 |
| 689.04907408 | 0 |
| 689.16980495 | 0 |
| 689.29053716 | 0 |
| 689.41127069 | 0 |
| 689.53200556 | 0 |
| 689.65274176 | 0 |
| 689.77347928 | 0 |
| 689.89421813 | 0 |
| 690.01495831 | 0 |
| 690.13569981 | 0 |
| 690.25644264 | 0 |
| 690.37718678 | 0 |
| 690.49793224 | 0 |
| 690.61867902 | 0 |
| 690.73942712 | 0 |
| 690.86017653 | 0 |
| 690.98092725 | 0 |
| 691.10167929 | 0 |
| 691.22243263 | 0 |
| 691.34318729 | 0 |
| 691.46394325 | 0 |
| 691.58470051 | 0 |
| 691.70545908 | 0 |
| 691.82621895 | 0 |
| 691.94698012 | 0 |
| 692.06774259 | 0 |
| 692.18850636 | 0 |
| 692.30927142 | 0 |
| 692.43003778 | 0 |
| 692.55080543 | 0 |
| 692.67157437 | 0 |
| 692.7923446 | 0 |
| 692.91311612 | 0 |
| 693.03388893 | 0 |
| 693.15466302 | 0 |
| 693.27543839 | 0 |
| 693.39621505 | 0 |
| 693.51699298 | 0 |
| 693.6377722 | 0 |
| 693.75855269 | 0 |
| 693.87933446 | 0 |
| 694.00011751 | 0 |
| 694.12090182 | 0 |
| 694.24168741 | 0 |
| 694.36247427 | 0 |
| 694.48326239 | 0 |
| 694.60405178 | 0 |
| 694.72484244 | 0 |
| 694.84563436 | 0 |
| 694.96642754 | 0 |
| 695.08722199 | 0 |
| 695.20801769 | 0 |
| 695.32881465 | 0 |
| 695.44961286 | 0 |
| 695.57041233 | 0 |
| 695.69121305 | 0 |
| 695.81201502 | 0 |
| 695.93281825 | 0 |
| 696.05362272 | 0 |
| 696.17442843 | 0 |
| 696.2952354 | 0 |
| 696.4160436 | 0 |
| 696.53685305 | 0 |
| 696.65766374 | 0 |
| 696.77847566 | 0 |
| 696.89928883 | 0 |
| 697.02010323 | 0 |
| 697.14091886 | 0 |
| 697.26173573 | 0 |
| 697.38255382 | 0 |
| 697.50337315 | 0 |
| 697.6241937 | 0 |
| 697.74501549 | 0 |
| 697.86583849 | 0 |
| 697.98666272 | 0 |
| 698.10748817 | 0 |
| 698.22831485 | 0 |
| 698.34914274 | 0 |
| 698.46997184 | 0 |
| 698.59080217 | 0 |
| 698.71163371 | 0 |
| 698.83246646 | 0 |
| 698.95330042 | 0 |
| 699.07413559 | 0 |
| 699.19497197 | 0 |
| 699.31580955 | 0 |
| 699.43664834 | 0 |
| 699.55748834 | 0 |
| 699.67832953 | 0 |
| 699.79917193 | 0 |
| 699.92001552 | 0 |
| 700.04086031 | 0 |
| 700.1617063 | 0 |
| 700.28255348 | 0 |
| 700.40340185 | 0 |
| 700.52425142 | 0 |
| 700.64510217 | 0 |
| 700.76595412 | 0 |
| 700.88680724 | 0 |
| 701.00766156 | 0 |
| 701.12851705 | 0 |
| 701.24937373 | 0 |
| 701.37023159 | 0 |
| 701.49109063 | 0 |
| 701.61195084 | 0 |
| 701.73281223 | 0 |
| 701.8536748 | 0 |
| 701.97453853 | 0 |
| 702.09540344 | 0 |
| 702.21626952 | 0 |
| 702.33713676 | 0 |
| 702.45800517 | 0 |
| 702.57887475 | 0 |
| 702.69974549 | 0 |
| 702.82061739 | 0 |
| 702.94149045 | 0 |
| 703.06236467 | 0 |
| 703.18324005 | 0 |
| 703.30411658 | 0 |
| 703.42499426 | 0 |
| 703.5458731 | 0 |
| 703.66675309 | 0 |
| 703.78763423 | 0 |
| 703.90851652 | 0 |
| 704.02939995 | 0 |
| 704.15028453 | 0 |
| 704.27117025 | 0 |
| 704.39205711 | 0 |
| 704.51294511 | 0 |
| 704.63383425 | 0 |
| 704.75472453 | 0 |
| 704.87561595 | 0 |
| 704.99650849 | 0 |
| 705.11740217 | 0 |
| 705.23829698 | 0 |
| 705.35919293 | 0 |
| 705.48008999 | 0 |
| 705.60098819 | 0 |
| 705.72188751 | 0 |
| 705.84278795 | 0 |
| 705.96368951 | 0 |
| 706.0845922 | 0 |
| 706.205496 | 0 |
| 706.32640092 | 0 |
| 706.44730695 | 0 |
| 706.5682141 | 0 |
| 706.68912236 | 0 |
| 706.81003173 | 0 |
| 706.93094221 | 0 |
| 707.0518538 | 0 |
| 707.1727665 | 0 |
| 707.2936803 | 0 |
| 707.4145952 | 0 |
| 707.5355112 | 0 |
| 707.65642831 | 0 |
| 707.77734651 | 0 |
| 707.89826581 | 0 |
| 708.0191862 | 0 |
| 708.14010769 | 0 |
| 708.26103027 | 0 |
| 708.38195394 | 0 |
| 708.50287871 | 0 |
| 708.62380455 | 0 |
| 708.74473149 | 0 |
| 708.86565951 | 0 |
| 708.98658861 | 0 |
| 709.10751879 | 0 |
| 709.22845006 | 0 |
| 709.3493824 | 0 |
| 709.47031582 | 0 |
| 709.59125031 | 0 |
| 709.71218588 | 0 |
| 709.83312252 | 0 |
| 709.95406023 | 0 |
| 710.07499901 | 0 |
| 710.19593886 | 0 |
| 710.31687978 | 0 |
| 710.43782175 | 0 |
| 710.5587648 | 0 |
| 710.6797089 | 0 |
| 710.80065406 | 0 |
| 710.92160028 | 0 |
| 711.04254756 | 0 |
| 711.16349589 | 0 |
| 711.28444528 | 0 |
| 711.40539572 | 0 |
| 711.52634721 | 0 |
| 711.64729975 | 0 |
| 711.76825334 | 0 |
| 711.88920797 | 0 |
| 712.01016365 | 0 |
| 712.13112037 | 0 |
| 712.25207813 | 0 |
| 712.37303693 | 0 |
| 712.49399677 | 0 |
| 712.61495764 | 0 |
| 712.73591956 | 0 |
| 712.8568825 | 0 |
| 712.97784648 | 0 |
| 713.09881149 | 0 |
| 713.21977752 | 0 |
| 713.34074459 | 0 |
| 713.46171268 | 0 |
| 713.58268179 | 0 |
| 713.70365193 | 0 |
| 713.82462309 | 0 |
| 713.94559527 | 0 |
| 714.06656847 | 0 |
| 714.18754268 | 0 |
| 714.30851791 | 0 |
| 714.42949415 | 0 |
| 714.55047141 | 0 |
| 714.67144968 | 0 |
| 714.79242895 | 0 |
| 714.91340923 | 0 |
| 715.03439052 | 0 |
| 715.15537281 | 0 |
| 715.27635611 | 0 |
| 715.3973404 | 0 |
| 715.5183257 | 0 |
| 715.63931199 | 0 |
| 715.76029929 | 0 |
| 715.88128757 | 0 |
| 716.00227685 | 0 |
| 716.12326712 | 0 |
| 716.24425839 | 0 |
| 716.36525064 | 0 |
| 716.48624388 | 0 |
| 716.6072381 | 0 |
| 716.72823331 | 0 |
| 716.8492295 | 0 |
| 716.97022668 | 0 |
| 717.09122483 | 0 |
| 717.21222396 | 0 |
| 717.33322407 | 0 |
| 717.45422515 | 0 |
| 717.57522721 | 0 |
| 717.69623023 | 0 |
| 717.81723423 | 0 |
| 717.9382392 | 0 |
| 718.05924513 | 0 |
| 718.18025204 | 0 |
| 718.3012599 | 0 |
| 718.42226873 | 0 |
| 718.54327852 | 0 |
| 718.66428927 | 0 |
| 718.78530097 | 0 |
| 718.90631364 | 0 |
| 719.02732725 | 0 |
| 719.14834183 | 0 |
| 719.26935735 | 0 |
| 719.39037382 | 0 |
| 719.51139125 | 0 |
| 719.63240962 | 0 |
| 719.75342893 | 0 |
| 719.87444919 | 0 |
| 719.9954704 | 0 |
| 720.11649254 | 0 |
| 720.23751562 | 0 |
| 720.35853965 | 0 |
| 720.4795646 | 0 |
| 720.6005905 | 0 |
| 720.72161732 | 0 |
| 720.84264508 | 0 |
| 720.96367377 | 0 |
| 721.08470339 | 0 |
| 721.20573393 | 0 |
| 721.32676541 | 0 |
| 721.4477978 | 0 |
| 721.56883112 | 0 |
| 721.68986536 | 0 |
| 721.81090052 | 0 |
| 721.93193659 | 0 |
| 722.05297358 | 0 |
| 722.17401149 | 0 |
| 722.29505031 | 0 |
| 722.41609005 | 0 |
| 722.53713069 | 0 |
| 722.65817224 | 0 |
| 722.7792147 | 0 |
| 722.90025807 | 0 |
| 723.02130233 | 0 |
| 723.14234751 | 0 |
| 723.26339358 | 0 |
| 723.38444055 | 0 |
| 723.50548842 | 0 |
| 723.62653719 | 0 |
| 723.74758685 | 0 |
| 723.8686374 | 0 |
| 723.98968885 | 0 |
| 724.11074119 | 0 |
| 724.23179441 | 0 |
| 724.35284853 | 0 |
| 724.47390352 | 0 |
| 724.59495941 | 0 |
| 724.71601617 | 0 |
| 724.83707382 | 0 |
| 724.95813234 | 0 |
| 725.07919175 | 0 |
| 725.20025203 | 0 |
| 725.32131318 | 0 |
| 725.44237521 | 0 |
| 725.56343811 | 0 |
| 725.68450188 | 0 |
| 725.80556652 | 0 |
| 725.92663202 | 0 |
| 726.04769839 | 0 |
| 726.16876563 | 0 |
| 726.28983373 | 0 |
| 726.41090268 | 0 |
| 726.5319725 | 0 |
| 726.65304318 | 0 |
| 726.77411471 | 0 |
| 726.8951871 | 0 |
| 727.01626034 | 0 |
| 727.13733443 | 0 |
| 727.25840937 | 0 |
| 727.37948516 | 0 |
| 727.5005618 | 0 |
| 727.62163928 | 0 |
| 727.74271761 | 0 |
| 727.86379678 | 0 |
| 727.98487679 | 0 |
| 728.10595764 | 0 |
| 728.22703933 | 0 |
| 728.34812185 | 0 |
| 728.46920521 | 0 |
| 728.5902894 | 0 |
| 728.71137443 | 0 |
| 728.83246028 | 0 |
| 728.95354696 | 0 |
| 729.07463447 | 0 |
| 729.19572281 | 0 |
| 729.31681196 | 0 |
| 729.43790195 | 0 |
| 729.55899275 | 0 |
| 729.68008437 | 0 |
| 729.80117681 | 0 |
| 729.92227006 | 0 |
| 730.04336413 | 0 |
| 730.16445902 | 0 |
| 730.28555471 | 0 |
| 730.40665121 | 0 |
| 730.52774853 | 0 |
| 730.64884665 | 0 |
| 730.76994557 | 0 |
| 730.8910453 | 0 |
| 731.01214583 | 0 |
| 731.13324717 | 0 |
| 731.2543493 | 0 |
| 731.37545223 | 0 |
| 731.49655595 | 0 |
| 731.61766047 | 0 |
| 731.73876579 | 0 |
| 731.85987189 | 0 |
| 731.98097879 | 0 |
| 732.10208647 | 0 |
| 732.22319494 | 0 |
| 732.3443042 | 0 |
| 732.46541424 | 0 |
| 732.58652506 | 0 |
| 732.70763666 | 0 |
| 732.82874904 | 0 |
| 732.9498622 | 0 |
| 733.07097614 | 0 |
| 733.19209085 | 0 |
| 733.31320633 | 0 |
| 733.43432259 | 0 |
| 733.55543961 | 0 |
| 733.6765574 | 0 |
| 733.79767596 | 0 |
| 733.91879529 | 0 |
| 734.03991538 | 0 |
| 734.16103623 | 0 |
| 734.28215784 | 0 |
| 734.40328021 | 0 |
| 734.52440334 | 0 |
| 734.64552723 | 0 |
| 734.76665187 | 0 |
| 734.88777726 | 0 |
| 735.0089034 | 0 |
| 735.1300303 | 0 |
| 735.25115794 | 0 |
| 735.37228633 | 0 |
| 735.49341546 | 0 |
| 735.61454534 | 0 |
| 735.73567596 | 0 |
| 735.85680732 | 0 |
| 735.97793942 | 0 |
| 736.09907226 | 0 |
| 736.22020583 | 0 |
| 736.34134014 | 0 |
| 736.46247518 | 0 |
| 736.58361095 | 0 |
| 736.70474745 | 0 |
| 736.82588468 | 0 |
| 736.94702264 | 0 |
| 737.06816132 | 0 |
| 737.18930073 | 0 |
| 737.31044086 | 0 |
| 737.43158171 | 0 |
| 737.55272327 | 0 |
| 737.67386556 | 0 |
| 737.79500856 | 0 |
| 737.91615228 | 0 |
| 738.0372967 | 0 |
| 738.15844184 | 0 |
| 738.27958769 | 0 |
| 738.40073425 | 0 |
| 738.52188152 | 0 |
| 738.64302949 | 0 |
| 738.76417816 | 0 |
| 738.88532754 | 0 |
| 739.00647761 | 0 |
| 739.12762839 | 0 |
| 739.24877986 | 0 |
| 739.36993203 | 0 |
| 739.49108489 | 0 |
| 739.61223845 | 0 |
| 739.73339269 | 0 |
| 739.85454763 | 0 |
| 739.97570326 | 0 |
| 740.09685957 | 0 |
| 740.21801656 | 0 |
| 740.33917425 | 0 |
| 740.46033261 | 0 |
| 740.58149165 | 0 |
| 740.70265137 | 0 |
| 740.82381177 | 0 |
| 740.94497285 | 0 |
| 741.0661346 | 0 |
| 741.18729702 | 0 |
| 741.30846011 | 0 |
| 741.42962388 | 0 |
| 741.55078831 | 0 |
| 741.6719534 | 0 |
| 741.79311917 | 0 |
| 741.91428559 | 0 |
| 742.03545268 | 0 |
| 742.15662043 | 0 |
| 742.27778884 | 0 |
| 742.39895791 | 0 |
| 742.52012763 | 0 |
| 742.641298 | 0 |
| 742.76246903 | 0 |
| 742.88364071 | 0 |
| 743.00481304 | 0 |
| 743.12598602 | 0 |
| 743.24715964 | 0 |
| 743.36833391 | 0 |
| 743.48950882 | 0 |
| 743.61068437 | 0 |
| 743.73186057 | 0 |
| 743.8530374 | 0 |
| 743.97421487 | 0 |
| 744.09539298 | 0 |
| 744.21657172 | 0 |
| 744.33775109 | 0 |
| 744.4589311 | 0 |
| 744.58011173 | 0 |
| 744.70129299 | 0 |
| 744.82247488 | 0 |
| 744.9436574 | 0 |
| 745.06484053 | 0 |
| 745.18602429 | 0 |
| 745.30720867 | 0 |
| 745.42839367 | 0 |
| 745.54957929 | 0 |